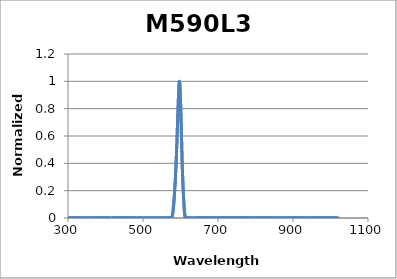
| Category | Normalized Intensity |
|---|---|
| 194.11 | 0.001 |
| 194.31 | -0.001 |
| 194.52 | 0.001 |
| 194.72 | -0.001 |
| 194.92 | -0.001 |
| 195.12 | 0.001 |
| 195.33 | -0.001 |
| 195.53 | -0.001 |
| 195.73 | 0.001 |
| 195.93 | -0.003 |
| 196.13 | 0 |
| 196.34 | -0.002 |
| 196.54 | 0.002 |
| 196.74 | -0.003 |
| 196.94 | 0 |
| 197.15 | -0.003 |
| 197.35 | -0.001 |
| 197.55 | 0 |
| 197.75 | -0.001 |
| 197.96 | 0 |
| 198.16 | 0.002 |
| 198.36 | -0.001 |
| 198.56 | 0.002 |
| 198.76 | 0 |
| 198.97 | 0 |
| 199.17 | -0.003 |
| 199.37 | 0.001 |
| 199.57 | -0.002 |
| 199.78 | -0.001 |
| 199.98 | -0.002 |
| 200.18 | 0 |
| 200.39 | 0 |
| 200.59 | -0.001 |
| 200.79 | -0.001 |
| 200.99 | 0.003 |
| 201.2 | 0.001 |
| 201.4 | 0.001 |
| 201.6 | -0.002 |
| 201.8 | 0.003 |
| 202.01 | 0 |
| 202.21 | 0.001 |
| 202.41 | 0 |
| 202.62 | -0.001 |
| 202.82 | -0.001 |
| 203.02 | 0.001 |
| 203.22 | -0.001 |
| 203.43 | -0.001 |
| 203.63 | -0.002 |
| 203.83 | -0.001 |
| 204.04 | -0.001 |
| 204.24 | 0.001 |
| 204.44 | -0.001 |
| 204.64 | -0.001 |
| 204.85 | -0.002 |
| 205.05 | -0.001 |
| 205.25 | -0.004 |
| 205.46 | 0.001 |
| 205.66 | -0.001 |
| 205.86 | 0.001 |
| 206.07 | -0.001 |
| 206.27 | 0.001 |
| 206.47 | -0.001 |
| 206.68 | -0.001 |
| 206.88 | -0.001 |
| 207.08 | -0.003 |
| 207.29 | -0.001 |
| 207.49 | 0 |
| 207.69 | -0.002 |
| 207.89 | 0 |
| 208.1 | -0.001 |
| 208.3 | -0.001 |
| 208.5 | -0.002 |
| 208.71 | 0.001 |
| 208.91 | 0 |
| 209.12 | 0 |
| 209.32 | -0.001 |
| 209.52 | 0.002 |
| 209.73 | 0 |
| 209.93 | -0.002 |
| 210.13 | 0 |
| 210.34 | 0.001 |
| 210.54 | -0.002 |
| 210.74 | 0.002 |
| 210.95 | -0.001 |
| 211.15 | 0.002 |
| 211.35 | 0 |
| 211.56 | 0 |
| 211.76 | -0.001 |
| 211.96 | 0.001 |
| 212.17 | -0.002 |
| 212.37 | 0.001 |
| 212.58 | -0.001 |
| 212.78 | 0 |
| 212.98 | -0.001 |
| 213.19 | 0 |
| 213.39 | -0.001 |
| 213.59 | 0 |
| 213.8 | -0.001 |
| 214.0 | -0.001 |
| 214.21 | -0.001 |
| 214.41 | -0.001 |
| 214.61 | 0.001 |
| 214.82 | -0.001 |
| 215.02 | -0.002 |
| 215.23 | -0.001 |
| 215.43 | 0 |
| 215.63 | 0 |
| 215.84 | 0 |
| 216.04 | 0.003 |
| 216.25 | -0.001 |
| 216.45 | 0 |
| 216.65 | -0.001 |
| 216.86 | -0.002 |
| 217.06 | -0.002 |
| 217.27 | 0 |
| 217.47 | -0.001 |
| 217.67 | 0 |
| 217.88 | 0 |
| 218.08 | 0.001 |
| 218.29 | -0.001 |
| 218.49 | 0 |
| 218.7 | 0.002 |
| 218.9 | -0.001 |
| 219.1 | 0.001 |
| 219.31 | -0.001 |
| 219.51 | -0.002 |
| 219.72 | 0 |
| 219.92 | -0.001 |
| 220.13 | 0.002 |
| 220.33 | -0.001 |
| 220.53 | 0 |
| 220.74 | -0.001 |
| 220.94 | -0.001 |
| 221.15 | -0.002 |
| 221.35 | 0 |
| 221.56 | -0.001 |
| 221.76 | -0.001 |
| 221.97 | -0.003 |
| 222.17 | 0 |
| 222.38 | -0.001 |
| 222.58 | -0.002 |
| 222.78 | -0.001 |
| 222.99 | 0 |
| 223.19 | -0.002 |
| 223.4 | 0.001 |
| 223.6 | 0 |
| 223.81 | 0.001 |
| 224.01 | 0 |
| 224.22 | -0.002 |
| 224.42 | -0.001 |
| 224.63 | -0.002 |
| 224.83 | -0.002 |
| 225.04 | 0 |
| 225.24 | -0.001 |
| 225.45 | 0.001 |
| 225.65 | -0.001 |
| 225.86 | 0 |
| 226.06 | -0.001 |
| 226.27 | 0 |
| 226.47 | 0.001 |
| 226.68 | -0.002 |
| 226.88 | -0.001 |
| 227.09 | -0.002 |
| 227.29 | -0.001 |
| 227.5 | -0.002 |
| 227.7 | -0.001 |
| 227.91 | 0 |
| 228.11 | 0 |
| 228.32 | -0.001 |
| 228.52 | 0 |
| 228.73 | 0.001 |
| 228.93 | -0.003 |
| 229.14 | -0.001 |
| 229.34 | 0.001 |
| 229.55 | 0.001 |
| 229.75 | 0 |
| 229.96 | 0 |
| 230.16 | -0.001 |
| 230.37 | 0 |
| 230.57 | 0 |
| 230.78 | 0.001 |
| 230.98 | 0.002 |
| 231.19 | 0.001 |
| 231.39 | -0.001 |
| 231.6 | 0.001 |
| 231.81 | -0.001 |
| 232.01 | -0.001 |
| 232.22 | -0.002 |
| 232.42 | -0.001 |
| 232.63 | -0.004 |
| 232.83 | 0 |
| 233.04 | -0.002 |
| 233.24 | 0.003 |
| 233.45 | 0 |
| 233.65 | 0.002 |
| 233.86 | -0.003 |
| 234.07 | 0 |
| 234.27 | 0 |
| 234.48 | 0.001 |
| 234.68 | 0 |
| 234.89 | 0 |
| 235.09 | 0 |
| 235.3 | 0.001 |
| 235.51 | -0.001 |
| 235.71 | 0.002 |
| 235.92 | -0.003 |
| 236.12 | -0.001 |
| 236.33 | 0 |
| 236.53 | 0 |
| 236.74 | 0 |
| 236.95 | -0.001 |
| 237.15 | -0.002 |
| 237.36 | -0.001 |
| 237.56 | 0 |
| 237.77 | -0.001 |
| 237.98 | -0.002 |
| 238.18 | -0.001 |
| 238.39 | -0.001 |
| 238.59 | 0.001 |
| 238.8 | 0.002 |
| 239.01 | 0.001 |
| 239.21 | 0.001 |
| 239.42 | -0.002 |
| 239.62 | -0.001 |
| 239.83 | 0.001 |
| 240.04 | -0.002 |
| 240.24 | -0.001 |
| 240.45 | -0.002 |
| 240.65 | -0.001 |
| 240.86 | -0.001 |
| 241.07 | -0.001 |
| 241.27 | -0.001 |
| 241.48 | 0 |
| 241.69 | -0.001 |
| 241.89 | -0.001 |
| 242.1 | -0.001 |
| 242.3 | 0.001 |
| 242.51 | -0.002 |
| 242.72 | -0.001 |
| 242.92 | -0.002 |
| 243.13 | 0.001 |
| 243.34 | -0.001 |
| 243.54 | 0.001 |
| 243.75 | 0.001 |
| 243.96 | -0.001 |
| 244.16 | -0.002 |
| 244.37 | -0.002 |
| 244.58 | 0 |
| 244.78 | 0.001 |
| 244.99 | -0.001 |
| 245.19 | 0.001 |
| 245.4 | -0.002 |
| 245.61 | -0.003 |
| 245.81 | -0.003 |
| 246.02 | -0.001 |
| 246.23 | 0 |
| 246.43 | -0.001 |
| 246.64 | -0.001 |
| 246.85 | 0.001 |
| 247.05 | -0.004 |
| 247.26 | 0.001 |
| 247.47 | 0 |
| 247.67 | -0.001 |
| 247.88 | 0 |
| 248.09 | 0.001 |
| 248.3 | -0.002 |
| 248.5 | 0.002 |
| 248.71 | -0.002 |
| 248.92 | 0 |
| 249.12 | 0 |
| 249.33 | 0 |
| 249.54 | -0.001 |
| 249.74 | 0.001 |
| 249.95 | -0.002 |
| 250.16 | 0 |
| 250.36 | -0.002 |
| 250.57 | 0.001 |
| 250.78 | -0.002 |
| 250.99 | -0.001 |
| 251.19 | -0.002 |
| 251.4 | 0.002 |
| 251.61 | 0 |
| 251.81 | 0.002 |
| 252.02 | -0.001 |
| 252.23 | 0.002 |
| 252.44 | 0.001 |
| 252.64 | 0 |
| 252.85 | 0 |
| 253.06 | 0 |
| 253.26 | -0.002 |
| 253.47 | 0 |
| 253.68 | -0.002 |
| 253.89 | -0.001 |
| 254.09 | -0.002 |
| 254.3 | -0.001 |
| 254.51 | 0 |
| 254.72 | 0.002 |
| 254.92 | -0.001 |
| 255.13 | 0.001 |
| 255.34 | -0.002 |
| 255.54 | -0.001 |
| 255.75 | 0.002 |
| 255.96 | 0 |
| 256.17 | -0.001 |
| 256.37 | 0.002 |
| 256.58 | 0 |
| 256.79 | 0.001 |
| 257.0 | 0.001 |
| 257.2 | 0.001 |
| 257.41 | -0.001 |
| 257.62 | 0.001 |
| 257.83 | -0.001 |
| 258.04 | -0.001 |
| 258.24 | 0 |
| 258.45 | -0.001 |
| 258.66 | 0 |
| 258.87 | 0.002 |
| 259.07 | -0.001 |
| 259.28 | -0.002 |
| 259.49 | -0.002 |
| 259.7 | 0 |
| 259.9 | 0 |
| 260.11 | -0.002 |
| 260.32 | -0.001 |
| 260.53 | 0 |
| 260.74 | -0.001 |
| 260.94 | -0.001 |
| 261.15 | -0.002 |
| 261.36 | 0.001 |
| 261.57 | -0.002 |
| 261.78 | 0 |
| 261.98 | 0.001 |
| 262.19 | 0 |
| 262.4 | -0.002 |
| 262.61 | 0 |
| 262.82 | -0.002 |
| 263.02 | 0 |
| 263.23 | -0.001 |
| 263.44 | 0.002 |
| 263.65 | -0.001 |
| 263.86 | 0 |
| 264.06 | 0 |
| 264.27 | 0.001 |
| 264.48 | 0 |
| 264.69 | 0 |
| 264.9 | 0.001 |
| 265.11 | 0.002 |
| 265.31 | 0 |
| 265.52 | -0.001 |
| 265.73 | -0.002 |
| 265.94 | 0 |
| 266.15 | 0.001 |
| 266.35 | 0 |
| 266.56 | -0.003 |
| 266.77 | 0 |
| 266.98 | 0 |
| 267.19 | 0 |
| 267.4 | -0.001 |
| 267.61 | 0 |
| 267.81 | -0.002 |
| 268.02 | 0 |
| 268.23 | -0.001 |
| 268.44 | 0.001 |
| 268.65 | -0.001 |
| 268.86 | 0.002 |
| 269.06 | -0.001 |
| 269.27 | 0.001 |
| 269.48 | -0.001 |
| 269.69 | 0.001 |
| 269.9 | -0.001 |
| 270.11 | -0.001 |
| 270.32 | -0.003 |
| 270.52 | 0.001 |
| 270.73 | -0.001 |
| 270.94 | -0.001 |
| 271.15 | -0.001 |
| 271.36 | -0.001 |
| 271.57 | 0 |
| 271.78 | 0 |
| 271.99 | 0 |
| 272.19 | 0.002 |
| 272.4 | -0.001 |
| 272.61 | 0.001 |
| 272.82 | -0.001 |
| 273.03 | -0.002 |
| 273.24 | 0 |
| 273.45 | 0.001 |
| 273.66 | 0 |
| 273.87 | 0 |
| 274.07 | -0.002 |
| 274.28 | 0.001 |
| 274.49 | -0.001 |
| 274.7 | -0.001 |
| 274.91 | 0.001 |
| 275.12 | -0.001 |
| 275.33 | -0.002 |
| 275.54 | 0 |
| 275.75 | -0.002 |
| 275.96 | -0.001 |
| 276.17 | -0.001 |
| 276.37 | 0 |
| 276.58 | -0.001 |
| 276.79 | -0.001 |
| 277.0 | -0.001 |
| 277.21 | -0.002 |
| 277.42 | -0.002 |
| 277.63 | 0.001 |
| 277.84 | 0.002 |
| 278.05 | 0.001 |
| 278.26 | 0 |
| 278.47 | 0 |
| 278.68 | 0.001 |
| 278.89 | 0.001 |
| 279.09 | -0.001 |
| 279.3 | 0.001 |
| 279.51 | 0.002 |
| 279.72 | 0.001 |
| 279.93 | -0.002 |
| 280.14 | 0.001 |
| 280.35 | 0.001 |
| 280.56 | 0.001 |
| 280.77 | 0.001 |
| 280.98 | -0.001 |
| 281.19 | -0.001 |
| 281.4 | 0.002 |
| 281.61 | -0.004 |
| 281.82 | 0 |
| 282.03 | 0.001 |
| 282.24 | 0 |
| 282.45 | -0.001 |
| 282.66 | 0.001 |
| 282.87 | -0.002 |
| 283.08 | 0 |
| 283.29 | 0 |
| 283.5 | 0.002 |
| 283.7 | -0.003 |
| 283.91 | -0.001 |
| 284.12 | -0.001 |
| 284.33 | 0 |
| 284.54 | 0 |
| 284.75 | -0.001 |
| 284.96 | -0.001 |
| 285.17 | 0.002 |
| 285.38 | -0.002 |
| 285.59 | 0 |
| 285.8 | -0.002 |
| 286.01 | 0 |
| 286.22 | 0 |
| 286.43 | 0.001 |
| 286.64 | -0.001 |
| 286.85 | -0.001 |
| 287.06 | -0.002 |
| 287.27 | -0.001 |
| 287.48 | -0.002 |
| 287.69 | 0 |
| 287.9 | -0.001 |
| 288.11 | 0 |
| 288.32 | 0.001 |
| 288.53 | -0.001 |
| 288.74 | -0.002 |
| 288.95 | 0.001 |
| 289.16 | -0.001 |
| 289.37 | 0.001 |
| 289.58 | -0.001 |
| 289.79 | -0.001 |
| 290.0 | -0.001 |
| 290.21 | -0.001 |
| 290.43 | -0.001 |
| 290.64 | 0.001 |
| 290.85 | -0.001 |
| 291.06 | -0.001 |
| 291.27 | 0 |
| 291.48 | 0 |
| 291.69 | -0.002 |
| 291.9 | 0 |
| 292.11 | -0.001 |
| 292.32 | 0 |
| 292.53 | 0 |
| 292.74 | 0.002 |
| 292.95 | 0 |
| 293.16 | -0.003 |
| 293.37 | -0.001 |
| 293.58 | -0.002 |
| 293.79 | 0 |
| 294.0 | 0.001 |
| 294.21 | -0.003 |
| 294.42 | 0 |
| 294.63 | 0.001 |
| 294.84 | 0.002 |
| 295.06 | -0.002 |
| 295.27 | 0 |
| 295.48 | -0.001 |
| 295.69 | 0.001 |
| 295.9 | 0.002 |
| 296.11 | -0.002 |
| 296.32 | 0.002 |
| 296.53 | 0.002 |
| 296.74 | -0.001 |
| 296.95 | 0.001 |
| 297.16 | -0.002 |
| 297.37 | 0 |
| 297.58 | 0.001 |
| 297.79 | -0.001 |
| 298.01 | -0.002 |
| 298.22 | -0.003 |
| 298.43 | 0.001 |
| 298.64 | 0.001 |
| 298.85 | 0.001 |
| 299.06 | -0.001 |
| 299.27 | 0.001 |
| 299.48 | 0.003 |
| 299.69 | -0.001 |
| 299.9 | 0 |
| 300.12 | -0.002 |
| 300.33 | 0.001 |
| 300.54 | -0.002 |
| 300.75 | 0.001 |
| 300.96 | 0 |
| 301.17 | 0.001 |
| 301.38 | 0 |
| 301.59 | 0 |
| 301.8 | -0.001 |
| 302.02 | 0 |
| 302.23 | 0 |
| 302.44 | -0.001 |
| 302.65 | -0.001 |
| 302.86 | 0 |
| 303.07 | -0.001 |
| 303.28 | 0 |
| 303.49 | 0.001 |
| 303.71 | 0.003 |
| 303.92 | -0.002 |
| 304.13 | 0.002 |
| 304.34 | 0.001 |
| 304.55 | -0.001 |
| 304.76 | -0.002 |
| 304.97 | 0.001 |
| 305.18 | -0.001 |
| 305.4 | 0.001 |
| 305.61 | -0.003 |
| 305.82 | 0 |
| 306.03 | -0.001 |
| 306.24 | -0.001 |
| 306.45 | 0 |
| 306.67 | 0.001 |
| 306.88 | -0.001 |
| 307.09 | 0.002 |
| 307.3 | -0.003 |
| 307.51 | -0.001 |
| 307.72 | 0 |
| 307.93 | 0 |
| 308.15 | 0 |
| 308.36 | -0.002 |
| 308.57 | 0 |
| 308.78 | 0 |
| 308.99 | -0.001 |
| 309.21 | 0 |
| 309.42 | 0 |
| 309.63 | 0 |
| 309.84 | -0.003 |
| 310.05 | -0.001 |
| 310.26 | 0.001 |
| 310.48 | 0.001 |
| 310.69 | -0.002 |
| 310.9 | 0.001 |
| 311.11 | 0.001 |
| 311.32 | 0.002 |
| 311.54 | -0.002 |
| 311.75 | 0.001 |
| 311.96 | 0.002 |
| 312.17 | -0.001 |
| 312.38 | -0.001 |
| 312.6 | 0 |
| 312.81 | 0 |
| 313.02 | 0.001 |
| 313.23 | -0.001 |
| 313.44 | 0.003 |
| 313.66 | 0 |
| 313.87 | 0.002 |
| 314.08 | -0.001 |
| 314.29 | -0.001 |
| 314.5 | -0.002 |
| 314.72 | 0 |
| 314.93 | -0.001 |
| 315.14 | 0 |
| 315.35 | 0 |
| 315.56 | 0 |
| 315.78 | -0.002 |
| 315.99 | -0.002 |
| 316.2 | 0 |
| 316.41 | 0.001 |
| 316.63 | -0.001 |
| 316.84 | -0.001 |
| 317.05 | 0 |
| 317.26 | 0 |
| 317.48 | 0.001 |
| 317.69 | 0 |
| 317.9 | 0 |
| 318.11 | -0.002 |
| 318.33 | -0.004 |
| 318.54 | 0 |
| 318.75 | -0.002 |
| 318.96 | 0 |
| 319.17 | 0.001 |
| 319.39 | 0.002 |
| 319.6 | -0.002 |
| 319.81 | 0.001 |
| 320.03 | 0.002 |
| 320.24 | 0.001 |
| 320.45 | 0 |
| 320.66 | 0 |
| 320.88 | 0.001 |
| 321.09 | 0 |
| 321.3 | -0.003 |
| 321.51 | 0 |
| 321.73 | -0.005 |
| 321.94 | 0 |
| 322.15 | -0.001 |
| 322.36 | 0 |
| 322.58 | -0.003 |
| 322.79 | 0 |
| 323.0 | -0.001 |
| 323.22 | 0.001 |
| 323.43 | -0.001 |
| 323.64 | -0.001 |
| 323.85 | -0.001 |
| 324.07 | 0.002 |
| 324.28 | -0.002 |
| 324.49 | 0 |
| 324.71 | -0.002 |
| 324.92 | -0.001 |
| 325.13 | -0.002 |
| 325.34 | 0 |
| 325.56 | -0.001 |
| 325.77 | -0.001 |
| 325.98 | -0.003 |
| 326.2 | 0.001 |
| 326.41 | 0 |
| 326.62 | 0 |
| 326.84 | -0.004 |
| 327.05 | 0.001 |
| 327.26 | -0.002 |
| 327.47 | 0 |
| 327.69 | -0.001 |
| 327.9 | 0.001 |
| 328.11 | 0 |
| 328.33 | -0.001 |
| 328.54 | -0.001 |
| 328.75 | 0.001 |
| 328.97 | -0.001 |
| 329.18 | -0.001 |
| 329.39 | -0.001 |
| 329.61 | 0.002 |
| 329.82 | 0 |
| 330.03 | -0.001 |
| 330.25 | 0.002 |
| 330.46 | 0 |
| 330.67 | -0.001 |
| 330.89 | 0 |
| 331.1 | 0.001 |
| 331.31 | -0.001 |
| 331.53 | -0.001 |
| 331.74 | 0.002 |
| 331.95 | 0.002 |
| 332.17 | 0 |
| 332.38 | -0.001 |
| 332.59 | 0.002 |
| 332.81 | -0.002 |
| 333.02 | 0 |
| 333.24 | 0.001 |
| 333.45 | 0 |
| 333.66 | 0 |
| 333.88 | 0.001 |
| 334.09 | -0.001 |
| 334.3 | 0 |
| 334.52 | -0.003 |
| 334.73 | 0.001 |
| 334.94 | -0.002 |
| 335.16 | -0.001 |
| 335.37 | -0.002 |
| 335.59 | 0 |
| 335.8 | -0.001 |
| 336.01 | 0.001 |
| 336.23 | -0.001 |
| 336.44 | 0 |
| 336.65 | 0.001 |
| 336.87 | -0.001 |
| 337.08 | 0.001 |
| 337.3 | -0.001 |
| 337.51 | 0 |
| 337.72 | 0.001 |
| 337.94 | 0 |
| 338.15 | -0.001 |
| 338.37 | -0.002 |
| 338.58 | 0.001 |
| 338.79 | 0 |
| 339.01 | 0 |
| 339.22 | -0.001 |
| 339.44 | 0 |
| 339.65 | -0.001 |
| 339.86 | 0.002 |
| 340.08 | -0.002 |
| 340.29 | -0.001 |
| 340.51 | -0.001 |
| 340.72 | -0.002 |
| 340.93 | -0.004 |
| 341.15 | 0 |
| 341.36 | -0.001 |
| 341.58 | -0.001 |
| 341.79 | 0 |
| 342.0 | -0.001 |
| 342.22 | -0.002 |
| 342.43 | 0 |
| 342.65 | 0 |
| 342.86 | 0 |
| 343.08 | 0.001 |
| 343.29 | 0.001 |
| 343.5 | 0.001 |
| 343.72 | 0.001 |
| 343.93 | -0.002 |
| 344.15 | -0.001 |
| 344.36 | -0.002 |
| 344.58 | 0 |
| 344.79 | -0.001 |
| 345.0 | 0.001 |
| 345.22 | 0 |
| 345.43 | 0 |
| 345.65 | 0 |
| 345.86 | -0.002 |
| 346.08 | 0.001 |
| 346.29 | 0.001 |
| 346.51 | -0.001 |
| 346.72 | 0 |
| 346.94 | -0.002 |
| 347.15 | 0.002 |
| 347.36 | -0.002 |
| 347.58 | -0.002 |
| 347.79 | -0.003 |
| 348.01 | 0.001 |
| 348.22 | -0.002 |
| 348.44 | 0 |
| 348.65 | -0.001 |
| 348.87 | 0.001 |
| 349.08 | -0.001 |
| 349.3 | 0.001 |
| 349.51 | -0.002 |
| 349.73 | 0.001 |
| 349.94 | -0.002 |
| 350.16 | 0.001 |
| 350.37 | 0.002 |
| 350.59 | -0.001 |
| 350.8 | -0.001 |
| 351.01 | 0.002 |
| 351.23 | -0.002 |
| 351.44 | -0.001 |
| 351.66 | 0 |
| 351.87 | -0.001 |
| 352.09 | -0.001 |
| 352.3 | 0 |
| 352.52 | -0.001 |
| 352.73 | -0.001 |
| 352.95 | -0.001 |
| 353.16 | -0.001 |
| 353.38 | -0.001 |
| 353.59 | -0.001 |
| 353.81 | 0.001 |
| 354.02 | 0 |
| 354.24 | -0.002 |
| 354.45 | 0 |
| 354.67 | -0.002 |
| 354.88 | -0.001 |
| 355.1 | 0.001 |
| 355.32 | -0.001 |
| 355.53 | 0 |
| 355.75 | 0.001 |
| 355.96 | -0.003 |
| 356.18 | 0.001 |
| 356.39 | 0.001 |
| 356.61 | -0.001 |
| 356.82 | -0.002 |
| 357.04 | 0 |
| 357.25 | 0 |
| 357.47 | 0 |
| 357.68 | -0.001 |
| 357.9 | -0.001 |
| 358.11 | -0.002 |
| 358.33 | -0.001 |
| 358.54 | 0 |
| 358.76 | -0.002 |
| 358.98 | -0.001 |
| 359.19 | 0 |
| 359.41 | 0 |
| 359.62 | -0.003 |
| 359.84 | -0.003 |
| 360.05 | 0 |
| 360.27 | -0.002 |
| 360.48 | -0.001 |
| 360.7 | 0 |
| 360.91 | 0 |
| 361.13 | -0.001 |
| 361.35 | 0.001 |
| 361.56 | -0.001 |
| 361.78 | -0.001 |
| 361.99 | -0.002 |
| 362.21 | 0 |
| 362.42 | 0 |
| 362.64 | -0.001 |
| 362.86 | 0.001 |
| 363.07 | 0.001 |
| 363.29 | 0 |
| 363.5 | -0.001 |
| 363.72 | -0.002 |
| 363.93 | 0 |
| 364.15 | -0.001 |
| 364.37 | 0 |
| 364.58 | -0.002 |
| 364.8 | 0 |
| 365.01 | -0.004 |
| 365.23 | 0.001 |
| 365.45 | -0.001 |
| 365.66 | 0.001 |
| 365.88 | 0.001 |
| 366.09 | -0.001 |
| 366.31 | -0.001 |
| 366.53 | 0.001 |
| 366.74 | -0.001 |
| 366.96 | 0 |
| 367.17 | -0.003 |
| 367.39 | 0 |
| 367.61 | 0 |
| 367.82 | -0.001 |
| 368.04 | 0 |
| 368.25 | 0.002 |
| 368.47 | 0 |
| 368.69 | 0 |
| 368.9 | 0 |
| 369.12 | 0 |
| 369.33 | 0.003 |
| 369.55 | 0 |
| 369.77 | -0.001 |
| 369.98 | 0 |
| 370.2 | -0.002 |
| 370.41 | 0 |
| 370.63 | -0.001 |
| 370.85 | 0.001 |
| 371.06 | 0 |
| 371.28 | -0.001 |
| 371.5 | -0.002 |
| 371.71 | 0.001 |
| 371.93 | -0.001 |
| 372.15 | 0 |
| 372.36 | -0.005 |
| 372.58 | -0.001 |
| 372.79 | -0.001 |
| 373.01 | 0.002 |
| 373.23 | -0.002 |
| 373.44 | 0.001 |
| 373.66 | 0.001 |
| 373.88 | 0 |
| 374.09 | 0 |
| 374.31 | 0.002 |
| 374.53 | -0.001 |
| 374.74 | -0.001 |
| 374.96 | -0.001 |
| 375.18 | 0.001 |
| 375.39 | -0.002 |
| 375.61 | 0 |
| 375.83 | 0 |
| 376.04 | -0.001 |
| 376.26 | 0 |
| 376.48 | 0.001 |
| 376.69 | -0.001 |
| 376.91 | -0.001 |
| 377.13 | -0.001 |
| 377.34 | 0.002 |
| 377.56 | 0.001 |
| 377.78 | 0 |
| 377.99 | 0.001 |
| 378.21 | 0 |
| 378.43 | -0.003 |
| 378.64 | 0 |
| 378.86 | -0.001 |
| 379.08 | 0.002 |
| 379.29 | -0.001 |
| 379.51 | 0.002 |
| 379.73 | 0 |
| 379.94 | -0.001 |
| 380.16 | -0.001 |
| 380.38 | 0 |
| 380.6 | 0 |
| 380.81 | 0.003 |
| 381.03 | 0.002 |
| 381.25 | -0.001 |
| 381.46 | 0.001 |
| 381.68 | -0.002 |
| 381.9 | -0.002 |
| 382.11 | 0 |
| 382.33 | -0.002 |
| 382.55 | -0.002 |
| 382.77 | -0.001 |
| 382.98 | 0.001 |
| 383.2 | 0.001 |
| 383.42 | 0 |
| 383.63 | 0 |
| 383.85 | -0.001 |
| 384.07 | 0 |
| 384.29 | -0.002 |
| 384.5 | 0.001 |
| 384.72 | 0.002 |
| 384.94 | -0.001 |
| 385.15 | 0 |
| 385.37 | -0.001 |
| 385.59 | 0.002 |
| 385.81 | -0.002 |
| 386.02 | 0.001 |
| 386.24 | -0.001 |
| 386.46 | -0.001 |
| 386.68 | 0.001 |
| 386.89 | 0 |
| 387.11 | -0.001 |
| 387.33 | 0.001 |
| 387.55 | 0.003 |
| 387.76 | 0.001 |
| 387.98 | -0.001 |
| 388.2 | 0.002 |
| 388.42 | -0.001 |
| 388.63 | 0.001 |
| 388.85 | 0.002 |
| 389.07 | -0.002 |
| 389.29 | -0.002 |
| 389.5 | 0.001 |
| 389.72 | 0.001 |
| 389.94 | 0.001 |
| 390.16 | 0.001 |
| 390.37 | -0.001 |
| 390.59 | 0 |
| 390.81 | 0 |
| 391.03 | -0.002 |
| 391.24 | 0.003 |
| 391.46 | -0.001 |
| 391.68 | 0 |
| 391.9 | 0 |
| 392.11 | 0.002 |
| 392.33 | -0.002 |
| 392.55 | 0.001 |
| 392.77 | -0.001 |
| 392.99 | -0.001 |
| 393.2 | -0.001 |
| 393.42 | -0.001 |
| 393.64 | -0.002 |
| 393.86 | 0.003 |
| 394.07 | -0.002 |
| 394.29 | 0.002 |
| 394.51 | 0 |
| 394.73 | -0.002 |
| 394.95 | -0.002 |
| 395.16 | 0 |
| 395.38 | -0.001 |
| 395.6 | 0.001 |
| 395.82 | -0.001 |
| 396.04 | 0.001 |
| 396.25 | 0 |
| 396.47 | 0.003 |
| 396.69 | -0.001 |
| 396.91 | 0.001 |
| 397.13 | 0 |
| 397.34 | 0.001 |
| 397.56 | 0 |
| 397.78 | 0 |
| 398.0 | -0.001 |
| 398.22 | 0.001 |
| 398.44 | -0.004 |
| 398.65 | 0.003 |
| 398.87 | 0.002 |
| 399.09 | -0.001 |
| 399.31 | 0 |
| 399.53 | 0.001 |
| 399.74 | 0 |
| 399.96 | 0 |
| 400.18 | 0 |
| 400.4 | 0 |
| 400.62 | -0.002 |
| 400.84 | 0 |
| 401.05 | -0.001 |
| 401.27 | 0.001 |
| 401.49 | 0 |
| 401.71 | -0.001 |
| 401.93 | 0 |
| 402.15 | 0 |
| 402.36 | -0.001 |
| 402.58 | 0 |
| 402.8 | 0 |
| 403.02 | 0.001 |
| 403.24 | 0.001 |
| 403.46 | 0 |
| 403.68 | 0 |
| 403.89 | 0 |
| 404.11 | 0 |
| 404.33 | -0.002 |
| 404.55 | -0.001 |
| 404.77 | 0 |
| 404.99 | -0.001 |
| 405.21 | 0.001 |
| 405.42 | 0 |
| 405.64 | -0.002 |
| 405.86 | 0.002 |
| 406.08 | -0.001 |
| 406.3 | 0 |
| 406.52 | 0 |
| 406.74 | 0 |
| 406.95 | 0.002 |
| 407.17 | 0 |
| 407.39 | 0 |
| 407.61 | 0 |
| 407.83 | -0.002 |
| 408.05 | 0 |
| 408.27 | 0 |
| 408.49 | 0.001 |
| 408.71 | -0.002 |
| 408.92 | -0.001 |
| 409.14 | 0 |
| 409.36 | -0.001 |
| 409.58 | 0.001 |
| 409.8 | 0.002 |
| 410.02 | 0 |
| 410.24 | 0.001 |
| 410.46 | 0 |
| 410.68 | 0 |
| 410.89 | 0 |
| 411.11 | 0 |
| 411.33 | -0.001 |
| 411.55 | 0.001 |
| 411.77 | 0.001 |
| 411.99 | 0.001 |
| 412.21 | -0.002 |
| 412.43 | 0.001 |
| 412.65 | -0.002 |
| 412.87 | 0 |
| 413.08 | -0.002 |
| 413.3 | 0 |
| 413.52 | 0 |
| 413.74 | 0 |
| 413.96 | 0 |
| 414.18 | -0.001 |
| 414.4 | 0 |
| 414.62 | -0.002 |
| 414.84 | -0.003 |
| 415.06 | -0.001 |
| 415.28 | -0.001 |
| 415.5 | 0 |
| 415.72 | -0.001 |
| 415.93 | -0.001 |
| 416.15 | -0.001 |
| 416.37 | -0.001 |
| 416.59 | -0.002 |
| 416.81 | 0.001 |
| 417.03 | -0.002 |
| 417.25 | 0.001 |
| 417.47 | 0.001 |
| 417.69 | 0.001 |
| 417.91 | 0 |
| 418.13 | 0.001 |
| 418.35 | -0.002 |
| 418.57 | 0.001 |
| 418.79 | -0.004 |
| 419.01 | -0.001 |
| 419.23 | -0.001 |
| 419.45 | -0.001 |
| 419.67 | -0.002 |
| 419.89 | 0.003 |
| 420.1 | -0.001 |
| 420.32 | 0 |
| 420.54 | -0.001 |
| 420.76 | 0.002 |
| 420.98 | 0 |
| 421.2 | 0 |
| 421.42 | -0.002 |
| 421.64 | 0.002 |
| 421.86 | -0.001 |
| 422.08 | 0 |
| 422.3 | 0.002 |
| 422.52 | 0 |
| 422.74 | 0.001 |
| 422.96 | 0 |
| 423.18 | 0.001 |
| 423.4 | 0.004 |
| 423.62 | 0 |
| 423.84 | 0.001 |
| 424.06 | 0 |
| 424.28 | -0.001 |
| 424.5 | 0 |
| 424.72 | -0.001 |
| 424.94 | 0.001 |
| 425.16 | 0 |
| 425.38 | 0.001 |
| 425.6 | 0 |
| 425.82 | 0 |
| 426.04 | 0.001 |
| 426.26 | 0 |
| 426.48 | 0 |
| 426.7 | -0.001 |
| 426.92 | -0.001 |
| 427.14 | -0.001 |
| 427.36 | 0.001 |
| 427.58 | -0.002 |
| 427.8 | -0.001 |
| 428.02 | 0 |
| 428.24 | 0 |
| 428.46 | 0 |
| 428.68 | 0 |
| 428.9 | 0 |
| 429.12 | -0.001 |
| 429.34 | 0 |
| 429.56 | 0 |
| 429.78 | -0.003 |
| 430.0 | 0.001 |
| 430.22 | -0.002 |
| 430.44 | 0.001 |
| 430.66 | -0.001 |
| 430.88 | 0.001 |
| 431.1 | 0 |
| 431.32 | 0.001 |
| 431.54 | -0.002 |
| 431.76 | 0.001 |
| 431.98 | -0.001 |
| 432.2 | 0.001 |
| 432.42 | 0 |
| 432.64 | 0 |
| 432.87 | -0.001 |
| 433.09 | -0.002 |
| 433.31 | -0.001 |
| 433.53 | 0.002 |
| 433.75 | 0 |
| 433.97 | 0 |
| 434.19 | -0.003 |
| 434.41 | 0 |
| 434.63 | -0.002 |
| 434.85 | 0.002 |
| 435.07 | -0.002 |
| 435.29 | 0 |
| 435.51 | 0.002 |
| 435.73 | -0.002 |
| 435.95 | -0.001 |
| 436.17 | 0.001 |
| 436.39 | -0.004 |
| 436.61 | -0.001 |
| 436.83 | -0.001 |
| 437.06 | -0.001 |
| 437.28 | -0.001 |
| 437.5 | 0.002 |
| 437.72 | 0 |
| 437.94 | -0.001 |
| 438.16 | 0 |
| 438.38 | 0.001 |
| 438.6 | -0.001 |
| 438.82 | 0.001 |
| 439.04 | -0.001 |
| 439.26 | -0.002 |
| 439.48 | 0 |
| 439.7 | 0.001 |
| 439.93 | -0.002 |
| 440.15 | -0.002 |
| 440.37 | 0.002 |
| 440.59 | 0.001 |
| 440.81 | 0 |
| 441.03 | 0 |
| 441.25 | 0 |
| 441.47 | 0.001 |
| 441.69 | -0.001 |
| 441.91 | 0.002 |
| 442.13 | -0.001 |
| 442.36 | 0.001 |
| 442.58 | -0.002 |
| 442.8 | 0.001 |
| 443.02 | 0 |
| 443.24 | 0.002 |
| 443.46 | 0.002 |
| 443.68 | 0.002 |
| 443.9 | -0.001 |
| 444.12 | 0.001 |
| 444.35 | 0.001 |
| 444.57 | 0.001 |
| 444.79 | 0.002 |
| 445.01 | 0 |
| 445.23 | -0.001 |
| 445.45 | -0.001 |
| 445.67 | -0.003 |
| 445.89 | 0 |
| 446.12 | -0.001 |
| 446.34 | -0.001 |
| 446.56 | 0 |
| 446.78 | 0 |
| 447.0 | -0.001 |
| 447.22 | 0.001 |
| 447.44 | 0.002 |
| 447.66 | 0 |
| 447.89 | 0 |
| 448.11 | 0.001 |
| 448.33 | 0 |
| 448.55 | 0.001 |
| 448.77 | 0 |
| 448.99 | 0.001 |
| 449.21 | 0 |
| 449.44 | 0.001 |
| 449.66 | -0.002 |
| 449.88 | -0.001 |
| 450.1 | -0.001 |
| 450.32 | 0 |
| 450.54 | -0.002 |
| 450.76 | 0 |
| 450.99 | 0 |
| 451.21 | 0.002 |
| 451.43 | 0.001 |
| 451.65 | 0 |
| 451.87 | -0.003 |
| 452.09 | 0.002 |
| 452.32 | -0.002 |
| 452.54 | -0.001 |
| 452.76 | -0.001 |
| 452.98 | 0.001 |
| 453.2 | -0.001 |
| 453.42 | -0.001 |
| 453.65 | -0.002 |
| 453.87 | -0.001 |
| 454.09 | -0.002 |
| 454.31 | -0.001 |
| 454.53 | -0.001 |
| 454.75 | 0.001 |
| 454.98 | 0.003 |
| 455.2 | 0 |
| 455.42 | -0.001 |
| 455.64 | 0 |
| 455.86 | -0.002 |
| 456.09 | 0.002 |
| 456.31 | 0 |
| 456.53 | 0.001 |
| 456.75 | 0 |
| 456.97 | 0 |
| 457.19 | 0.003 |
| 457.42 | -0.002 |
| 457.64 | 0 |
| 457.86 | -0.001 |
| 458.08 | -0.002 |
| 458.3 | -0.002 |
| 458.53 | 0.001 |
| 458.75 | 0.001 |
| 458.97 | -0.003 |
| 459.19 | 0 |
| 459.41 | 0.001 |
| 459.64 | -0.002 |
| 459.86 | 0.002 |
| 460.08 | 0 |
| 460.3 | -0.001 |
| 460.53 | -0.001 |
| 460.75 | 0 |
| 460.97 | 0 |
| 461.19 | -0.001 |
| 461.41 | 0.001 |
| 461.64 | -0.003 |
| 461.86 | -0.003 |
| 462.08 | 0 |
| 462.3 | 0 |
| 462.53 | 0.001 |
| 462.75 | 0.001 |
| 462.97 | 0.002 |
| 463.19 | -0.002 |
| 463.41 | -0.002 |
| 463.64 | 0 |
| 463.86 | 0 |
| 464.08 | 0 |
| 464.3 | 0 |
| 464.53 | 0.001 |
| 464.75 | 0 |
| 464.97 | 0 |
| 465.19 | -0.001 |
| 465.42 | -0.002 |
| 465.64 | 0.002 |
| 465.86 | -0.001 |
| 466.08 | -0.001 |
| 466.31 | -0.001 |
| 466.53 | 0.002 |
| 466.75 | 0 |
| 466.97 | -0.001 |
| 467.2 | -0.002 |
| 467.42 | 0.002 |
| 467.64 | -0.001 |
| 467.86 | 0.001 |
| 468.09 | -0.001 |
| 468.31 | 0 |
| 468.53 | -0.001 |
| 468.75 | -0.001 |
| 468.98 | 0 |
| 469.2 | 0.001 |
| 469.42 | 0 |
| 469.64 | 0 |
| 469.87 | 0.001 |
| 470.09 | -0.001 |
| 470.31 | 0 |
| 470.54 | 0.002 |
| 470.76 | -0.001 |
| 470.98 | 0 |
| 471.2 | 0.001 |
| 471.43 | 0.001 |
| 471.65 | -0.001 |
| 471.87 | 0 |
| 472.09 | 0.001 |
| 472.32 | 0.003 |
| 472.54 | -0.001 |
| 472.76 | 0.002 |
| 472.99 | -0.001 |
| 473.21 | -0.002 |
| 473.43 | -0.002 |
| 473.65 | 0.001 |
| 473.88 | 0 |
| 474.1 | 0.001 |
| 474.32 | -0.002 |
| 474.55 | -0.001 |
| 474.77 | 0.001 |
| 474.99 | 0 |
| 475.22 | -0.002 |
| 475.44 | 0.001 |
| 475.66 | -0.001 |
| 475.88 | 0.001 |
| 476.11 | 0 |
| 476.33 | 0 |
| 476.55 | -0.001 |
| 476.78 | 0 |
| 477.0 | 0.002 |
| 477.22 | 0 |
| 477.45 | -0.002 |
| 477.67 | 0.001 |
| 477.89 | -0.002 |
| 478.12 | 0 |
| 478.34 | -0.002 |
| 478.56 | 0.002 |
| 478.79 | -0.002 |
| 479.01 | -0.001 |
| 479.23 | -0.002 |
| 479.46 | 0 |
| 479.68 | 0 |
| 479.9 | 0.002 |
| 480.13 | 0.001 |
| 480.35 | -0.001 |
| 480.57 | -0.001 |
| 480.8 | 0.001 |
| 481.02 | -0.001 |
| 481.24 | -0.001 |
| 481.47 | -0.001 |
| 481.69 | -0.001 |
| 481.91 | -0.002 |
| 482.14 | -0.002 |
| 482.36 | 0.001 |
| 482.58 | -0.002 |
| 482.81 | 0 |
| 483.03 | 0 |
| 483.25 | -0.001 |
| 483.48 | 0.001 |
| 483.7 | -0.002 |
| 483.92 | 0 |
| 484.15 | -0.001 |
| 484.37 | 0 |
| 484.59 | -0.001 |
| 484.82 | -0.002 |
| 485.04 | 0 |
| 485.26 | 0.002 |
| 485.49 | -0.002 |
| 485.71 | 0 |
| 485.94 | -0.001 |
| 486.16 | 0.001 |
| 486.38 | -0.001 |
| 486.61 | 0.001 |
| 486.83 | 0 |
| 487.05 | -0.002 |
| 487.28 | -0.001 |
| 487.5 | 0 |
| 487.73 | -0.001 |
| 487.95 | 0.001 |
| 488.17 | 0 |
| 488.4 | 0 |
| 488.62 | 0.001 |
| 488.84 | 0 |
| 489.07 | -0.001 |
| 489.29 | 0.001 |
| 489.52 | -0.002 |
| 489.74 | 0 |
| 489.96 | -0.003 |
| 490.19 | -0.001 |
| 490.41 | -0.001 |
| 490.64 | 0 |
| 490.86 | 0 |
| 491.08 | 0.003 |
| 491.31 | 0.002 |
| 491.53 | 0 |
| 491.76 | 0 |
| 491.98 | 0 |
| 492.2 | 0.001 |
| 492.43 | -0.002 |
| 492.65 | -0.002 |
| 492.88 | -0.002 |
| 493.1 | 0 |
| 493.32 | -0.001 |
| 493.55 | 0.001 |
| 493.77 | -0.001 |
| 494.0 | -0.001 |
| 494.22 | 0.001 |
| 494.44 | 0 |
| 494.67 | 0.002 |
| 494.89 | -0.001 |
| 495.12 | 0.001 |
| 495.34 | 0 |
| 495.56 | 0 |
| 495.79 | -0.001 |
| 496.01 | 0 |
| 496.24 | -0.001 |
| 496.46 | 0.001 |
| 496.69 | 0.001 |
| 496.91 | 0.001 |
| 497.13 | 0.001 |
| 497.36 | 0 |
| 497.58 | -0.002 |
| 497.81 | -0.001 |
| 498.03 | 0.001 |
| 498.26 | 0 |
| 498.48 | -0.001 |
| 498.71 | -0.001 |
| 498.93 | -0.001 |
| 499.15 | -0.001 |
| 499.38 | -0.001 |
| 499.6 | 0 |
| 499.83 | -0.001 |
| 500.05 | 0 |
| 500.28 | -0.001 |
| 500.5 | -0.002 |
| 500.73 | 0 |
| 500.95 | 0 |
| 501.17 | 0.001 |
| 501.4 | 0 |
| 501.62 | 0.001 |
| 501.85 | -0.002 |
| 502.07 | -0.001 |
| 502.3 | 0.001 |
| 502.52 | 0 |
| 502.75 | -0.001 |
| 502.97 | -0.002 |
| 503.2 | -0.002 |
| 503.42 | -0.001 |
| 503.64 | 0.002 |
| 503.87 | -0.001 |
| 504.09 | 0 |
| 504.32 | 0 |
| 504.54 | 0 |
| 504.77 | 0.001 |
| 504.99 | 0 |
| 505.22 | 0.001 |
| 505.44 | 0.001 |
| 505.67 | 0 |
| 505.89 | -0.001 |
| 506.12 | -0.002 |
| 506.34 | 0 |
| 506.57 | 0 |
| 506.79 | -0.001 |
| 507.02 | -0.001 |
| 507.24 | 0.001 |
| 507.47 | -0.001 |
| 507.69 | 0 |
| 507.92 | -0.003 |
| 508.14 | 0 |
| 508.37 | -0.003 |
| 508.59 | 0 |
| 508.82 | 0.001 |
| 509.04 | -0.001 |
| 509.27 | -0.002 |
| 509.49 | 0 |
| 509.72 | -0.002 |
| 509.94 | 0.002 |
| 510.17 | -0.004 |
| 510.39 | 0 |
| 510.62 | -0.001 |
| 510.84 | 0.003 |
| 511.07 | 0 |
| 511.29 | -0.002 |
| 511.52 | -0.001 |
| 511.74 | -0.001 |
| 511.97 | -0.001 |
| 512.19 | -0.001 |
| 512.42 | 0 |
| 512.64 | 0 |
| 512.87 | 0 |
| 513.09 | 0.002 |
| 513.32 | -0.002 |
| 513.54 | 0.001 |
| 513.77 | -0.002 |
| 513.99 | 0.001 |
| 514.22 | 0.002 |
| 514.44 | 0.001 |
| 514.67 | -0.001 |
| 514.89 | 0 |
| 515.12 | 0 |
| 515.34 | 0 |
| 515.57 | -0.002 |
| 515.8 | 0.002 |
| 516.02 | 0 |
| 516.25 | 0.001 |
| 516.47 | 0 |
| 516.7 | -0.001 |
| 516.92 | 0 |
| 517.15 | 0.001 |
| 517.37 | 0.001 |
| 517.6 | -0.001 |
| 517.82 | -0.001 |
| 518.05 | -0.001 |
| 518.27 | 0 |
| 518.5 | -0.001 |
| 518.73 | 0.002 |
| 518.95 | -0.003 |
| 519.18 | -0.001 |
| 519.4 | -0.002 |
| 519.63 | 0.001 |
| 519.85 | -0.001 |
| 520.08 | 0.002 |
| 520.3 | -0.002 |
| 520.53 | -0.001 |
| 520.76 | -0.001 |
| 520.98 | 0.002 |
| 521.21 | 0 |
| 521.43 | 0 |
| 521.66 | 0 |
| 521.88 | 0 |
| 522.11 | -0.001 |
| 522.34 | 0 |
| 522.56 | 0 |
| 522.79 | 0 |
| 523.01 | -0.001 |
| 523.24 | -0.001 |
| 523.46 | -0.001 |
| 523.69 | -0.001 |
| 523.92 | -0.003 |
| 524.14 | 0 |
| 524.37 | -0.002 |
| 524.59 | 0 |
| 524.82 | -0.002 |
| 525.05 | -0.002 |
| 525.27 | 0 |
| 525.5 | 0 |
| 525.72 | -0.001 |
| 525.95 | 0.002 |
| 526.17 | -0.001 |
| 526.4 | 0.001 |
| 526.63 | -0.003 |
| 526.85 | 0 |
| 527.08 | 0 |
| 527.3 | 0.001 |
| 527.53 | -0.002 |
| 527.76 | 0.001 |
| 527.98 | 0 |
| 528.21 | 0 |
| 528.43 | -0.001 |
| 528.66 | 0 |
| 528.89 | 0 |
| 529.11 | 0.001 |
| 529.34 | -0.001 |
| 529.56 | -0.001 |
| 529.79 | -0.002 |
| 530.02 | 0 |
| 530.24 | 0 |
| 530.47 | 0 |
| 530.7 | 0.001 |
| 530.92 | -0.002 |
| 531.15 | -0.001 |
| 531.37 | -0.001 |
| 531.6 | -0.002 |
| 531.83 | -0.002 |
| 532.05 | -0.001 |
| 532.28 | -0.001 |
| 532.51 | -0.002 |
| 532.73 | -0.002 |
| 532.96 | -0.002 |
| 533.18 | 0.001 |
| 533.41 | -0.002 |
| 533.64 | 0.001 |
| 533.86 | -0.001 |
| 534.09 | -0.001 |
| 534.32 | 0 |
| 534.54 | 0 |
| 534.77 | -0.001 |
| 535.0 | 0.002 |
| 535.22 | -0.001 |
| 535.45 | 0 |
| 535.67 | 0.001 |
| 535.9 | 0.002 |
| 536.13 | -0.002 |
| 536.35 | -0.001 |
| 536.58 | -0.002 |
| 536.81 | 0.001 |
| 537.03 | -0.002 |
| 537.26 | -0.001 |
| 537.49 | -0.002 |
| 537.71 | -0.001 |
| 537.94 | -0.002 |
| 538.17 | -0.002 |
| 538.39 | 0.001 |
| 538.62 | -0.002 |
| 538.85 | -0.002 |
| 539.07 | -0.002 |
| 539.3 | -0.002 |
| 539.53 | -0.001 |
| 539.75 | 0 |
| 539.98 | 0.001 |
| 540.21 | 0 |
| 540.43 | 0 |
| 540.66 | -0.002 |
| 540.89 | 0 |
| 541.11 | 0.001 |
| 541.34 | -0.001 |
| 541.57 | -0.001 |
| 541.79 | -0.001 |
| 542.02 | 0.001 |
| 542.25 | -0.001 |
| 542.47 | 0.002 |
| 542.7 | 0 |
| 542.93 | -0.005 |
| 543.15 | -0.002 |
| 543.38 | -0.002 |
| 543.61 | 0.002 |
| 543.83 | 0 |
| 544.06 | 0.001 |
| 544.29 | -0.001 |
| 544.51 | -0.001 |
| 544.74 | 0 |
| 544.97 | 0.001 |
| 545.2 | -0.001 |
| 545.42 | 0 |
| 545.65 | -0.001 |
| 545.88 | 0 |
| 546.1 | -0.001 |
| 546.33 | 0 |
| 546.56 | -0.001 |
| 546.78 | 0.002 |
| 547.01 | 0.002 |
| 547.24 | 0.003 |
| 547.47 | 0.001 |
| 547.69 | -0.001 |
| 547.92 | 0.001 |
| 548.15 | 0.001 |
| 548.37 | -0.001 |
| 548.6 | -0.002 |
| 548.83 | -0.001 |
| 549.06 | -0.001 |
| 549.28 | -0.001 |
| 549.51 | 0.001 |
| 549.74 | 0.001 |
| 549.96 | 0 |
| 550.19 | -0.001 |
| 550.42 | 0 |
| 550.65 | -0.002 |
| 550.87 | 0.002 |
| 551.1 | 0 |
| 551.33 | -0.001 |
| 551.55 | 0 |
| 551.78 | 0 |
| 552.01 | -0.002 |
| 552.24 | 0 |
| 552.46 | -0.002 |
| 552.69 | 0 |
| 552.92 | -0.002 |
| 553.15 | 0 |
| 553.37 | -0.001 |
| 553.6 | 0 |
| 553.83 | -0.002 |
| 554.06 | -0.002 |
| 554.28 | 0 |
| 554.51 | 0 |
| 554.74 | 0.001 |
| 554.97 | 0 |
| 555.19 | -0.002 |
| 555.42 | 0 |
| 555.65 | 0 |
| 555.87 | -0.002 |
| 556.1 | 0 |
| 556.33 | 0 |
| 556.56 | 0.001 |
| 556.79 | 0 |
| 557.01 | 0 |
| 557.24 | 0.002 |
| 557.47 | 0 |
| 557.7 | 0.002 |
| 557.92 | -0.001 |
| 558.15 | 0 |
| 558.38 | -0.001 |
| 558.61 | 0.001 |
| 558.83 | -0.001 |
| 559.06 | 0 |
| 559.29 | 0.002 |
| 559.52 | -0.001 |
| 559.74 | -0.001 |
| 559.97 | 0.002 |
| 560.2 | 0.001 |
| 560.43 | 0 |
| 560.66 | -0.001 |
| 560.88 | 0.002 |
| 561.11 | -0.001 |
| 561.34 | 0 |
| 561.57 | -0.001 |
| 561.79 | 0.002 |
| 562.02 | -0.002 |
| 562.25 | -0.001 |
| 562.48 | -0.002 |
| 562.71 | 0.001 |
| 562.93 | 0.001 |
| 563.16 | 0.002 |
| 563.39 | 0 |
| 563.62 | -0.001 |
| 563.84 | 0 |
| 564.07 | -0.001 |
| 564.3 | -0.001 |
| 564.53 | 0 |
| 564.76 | -0.002 |
| 564.98 | 0.001 |
| 565.21 | 0 |
| 565.44 | -0.001 |
| 565.67 | 0.001 |
| 565.9 | 0.002 |
| 566.12 | 0 |
| 566.35 | 0.001 |
| 566.58 | 0 |
| 566.81 | 0.003 |
| 567.04 | 0 |
| 567.26 | 0 |
| 567.49 | -0.001 |
| 567.72 | 0.001 |
| 567.95 | -0.002 |
| 568.18 | -0.002 |
| 568.41 | -0.003 |
| 568.63 | -0.002 |
| 568.86 | -0.001 |
| 569.09 | 0.001 |
| 569.32 | 0 |
| 569.55 | -0.001 |
| 569.77 | -0.002 |
| 570.0 | 0 |
| 570.23 | -0.001 |
| 570.46 | 0 |
| 570.69 | 0.002 |
| 570.92 | 0 |
| 571.14 | -0.001 |
| 571.37 | 0.001 |
| 571.6 | 0.001 |
| 571.83 | 0.002 |
| 572.06 | -0.001 |
| 572.29 | 0 |
| 572.51 | 0 |
| 572.74 | 0.003 |
| 572.97 | 0.002 |
| 573.2 | 0 |
| 573.43 | 0.001 |
| 573.66 | 0 |
| 573.88 | 0.001 |
| 574.11 | 0 |
| 574.34 | 0.002 |
| 574.57 | 0.004 |
| 574.8 | 0 |
| 575.03 | 0.002 |
| 575.26 | 0.003 |
| 575.48 | 0.002 |
| 575.71 | 0.002 |
| 575.94 | 0.001 |
| 576.17 | 0.003 |
| 576.4 | 0.007 |
| 576.63 | 0.006 |
| 576.85 | 0.008 |
| 577.08 | 0.008 |
| 577.31 | 0.01 |
| 577.54 | 0.01 |
| 577.77 | 0.014 |
| 578.0 | 0.016 |
| 578.23 | 0.019 |
| 578.46 | 0.017 |
| 578.68 | 0.022 |
| 578.91 | 0.023 |
| 579.14 | 0.034 |
| 579.37 | 0.036 |
| 579.6 | 0.043 |
| 579.83 | 0.044 |
| 580.06 | 0.052 |
| 580.28 | 0.054 |
| 580.51 | 0.066 |
| 580.74 | 0.068 |
| 580.97 | 0.083 |
| 581.2 | 0.077 |
| 581.43 | 0.088 |
| 581.66 | 0.092 |
| 581.89 | 0.104 |
| 582.12 | 0.103 |
| 582.34 | 0.117 |
| 582.57 | 0.123 |
| 582.8 | 0.138 |
| 583.03 | 0.138 |
| 583.26 | 0.152 |
| 583.49 | 0.16 |
| 583.72 | 0.173 |
| 583.95 | 0.176 |
| 584.18 | 0.19 |
| 584.4 | 0.195 |
| 584.63 | 0.209 |
| 584.86 | 0.214 |
| 585.09 | 0.233 |
| 585.32 | 0.234 |
| 585.55 | 0.257 |
| 585.78 | 0.253 |
| 586.01 | 0.269 |
| 586.24 | 0.279 |
| 586.47 | 0.304 |
| 586.69 | 0.31 |
| 586.92 | 0.33 |
| 587.15 | 0.334 |
| 587.38 | 0.353 |
| 587.61 | 0.357 |
| 587.84 | 0.38 |
| 588.07 | 0.387 |
| 588.3 | 0.412 |
| 588.53 | 0.411 |
| 588.76 | 0.446 |
| 588.99 | 0.448 |
| 589.21 | 0.467 |
| 589.44 | 0.483 |
| 589.67 | 0.505 |
| 589.9 | 0.513 |
| 590.13 | 0.53 |
| 590.36 | 0.543 |
| 590.59 | 0.579 |
| 590.82 | 0.584 |
| 591.05 | 0.605 |
| 591.28 | 0.616 |
| 591.51 | 0.648 |
| 591.74 | 0.662 |
| 591.97 | 0.679 |
| 592.19 | 0.699 |
| 592.42 | 0.72 |
| 592.65 | 0.731 |
| 592.88 | 0.758 |
| 593.11 | 0.771 |
| 593.34 | 0.791 |
| 593.57 | 0.809 |
| 593.8 | 0.835 |
| 594.03 | 0.843 |
| 594.26 | 0.866 |
| 594.49 | 0.884 |
| 594.72 | 0.909 |
| 594.95 | 0.915 |
| 595.18 | 0.943 |
| 595.41 | 0.936 |
| 595.64 | 0.969 |
| 595.87 | 0.972 |
| 596.1 | 0.98 |
| 596.32 | 0.977 |
| 596.55 | 1 |
| 596.78 | 0.993 |
| 597.01 | 0.99 |
| 597.24 | 0.99 |
| 597.47 | 0.983 |
| 597.7 | 0.99 |
| 597.93 | 0.991 |
| 598.16 | 0.977 |
| 598.39 | 0.979 |
| 598.62 | 0.958 |
| 598.85 | 0.94 |
| 599.08 | 0.925 |
| 599.31 | 0.923 |
| 599.54 | 0.896 |
| 599.77 | 0.881 |
| 600.0 | 0.864 |
| 600.23 | 0.845 |
| 600.46 | 0.82 |
| 600.69 | 0.8 |
| 600.92 | 0.775 |
| 601.15 | 0.751 |
| 601.38 | 0.727 |
| 601.61 | 0.704 |
| 601.84 | 0.667 |
| 602.07 | 0.647 |
| 602.3 | 0.623 |
| 602.53 | 0.605 |
| 602.76 | 0.575 |
| 602.99 | 0.563 |
| 603.22 | 0.53 |
| 603.45 | 0.508 |
| 603.68 | 0.487 |
| 603.91 | 0.469 |
| 604.14 | 0.436 |
| 604.36 | 0.413 |
| 604.59 | 0.397 |
| 604.82 | 0.381 |
| 605.05 | 0.353 |
| 605.28 | 0.343 |
| 605.51 | 0.321 |
| 605.74 | 0.302 |
| 605.97 | 0.283 |
| 606.2 | 0.278 |
| 606.43 | 0.253 |
| 606.66 | 0.24 |
| 606.89 | 0.219 |
| 607.12 | 0.21 |
| 607.35 | 0.193 |
| 607.58 | 0.185 |
| 607.81 | 0.165 |
| 608.05 | 0.159 |
| 608.28 | 0.14 |
| 608.51 | 0.139 |
| 608.74 | 0.116 |
| 608.97 | 0.112 |
| 609.2 | 0.095 |
| 609.43 | 0.087 |
| 609.66 | 0.077 |
| 609.89 | 0.075 |
| 610.12 | 0.055 |
| 610.35 | 0.052 |
| 610.58 | 0.045 |
| 610.81 | 0.04 |
| 611.04 | 0.031 |
| 611.27 | 0.027 |
| 611.5 | 0.024 |
| 611.73 | 0.019 |
| 611.96 | 0.012 |
| 612.19 | 0.014 |
| 612.42 | 0.01 |
| 612.65 | 0.01 |
| 612.88 | 0.004 |
| 613.11 | 0.005 |
| 613.34 | 0.004 |
| 613.57 | 0.003 |
| 613.8 | 0.003 |
| 614.03 | 0.001 |
| 614.26 | 0.003 |
| 614.49 | 0.002 |
| 614.72 | 0.003 |
| 614.95 | -0.001 |
| 615.18 | 0 |
| 615.41 | 0.001 |
| 615.64 | 0 |
| 615.87 | 0.002 |
| 616.1 | 0.003 |
| 616.34 | 0 |
| 616.57 | 0.001 |
| 616.8 | -0.001 |
| 617.03 | 0.002 |
| 617.26 | 0.001 |
| 617.49 | 0.001 |
| 617.72 | -0.001 |
| 617.95 | -0.002 |
| 618.18 | -0.001 |
| 618.41 | 0 |
| 618.64 | -0.001 |
| 618.87 | -0.001 |
| 619.1 | -0.002 |
| 619.33 | 0 |
| 619.56 | -0.003 |
| 619.79 | 0 |
| 620.02 | 0 |
| 620.26 | 0.003 |
| 620.49 | 0 |
| 620.72 | 0.001 |
| 620.95 | 0 |
| 621.18 | 0.001 |
| 621.41 | -0.002 |
| 621.64 | -0.001 |
| 621.87 | -0.001 |
| 622.1 | 0 |
| 622.33 | -0.002 |
| 622.56 | -0.001 |
| 622.79 | 0.001 |
| 623.02 | 0 |
| 623.25 | 0.001 |
| 623.49 | 0.001 |
| 623.72 | -0.002 |
| 623.95 | 0 |
| 624.18 | -0.001 |
| 624.41 | 0 |
| 624.64 | 0 |
| 624.87 | 0.001 |
| 625.1 | -0.002 |
| 625.33 | -0.002 |
| 625.56 | -0.003 |
| 625.79 | 0.001 |
| 626.03 | -0.002 |
| 626.26 | -0.001 |
| 626.49 | 0 |
| 626.72 | 0 |
| 626.95 | -0.002 |
| 627.18 | 0 |
| 627.41 | -0.003 |
| 627.64 | -0.001 |
| 627.87 | -0.001 |
| 628.1 | 0.002 |
| 628.33 | -0.002 |
| 628.57 | 0.001 |
| 628.8 | 0.001 |
| 629.03 | 0.001 |
| 629.26 | -0.001 |
| 629.49 | 0.001 |
| 629.72 | -0.001 |
| 629.95 | -0.002 |
| 630.18 | -0.001 |
| 630.41 | -0.001 |
| 630.65 | 0 |
| 630.88 | 0 |
| 631.11 | -0.001 |
| 631.34 | 0.001 |
| 631.57 | -0.001 |
| 631.8 | -0.001 |
| 632.03 | 0 |
| 632.26 | 0 |
| 632.5 | -0.002 |
| 632.73 | -0.001 |
| 632.96 | -0.001 |
| 633.19 | 0.001 |
| 633.42 | -0.001 |
| 633.65 | -0.002 |
| 633.88 | 0.002 |
| 634.11 | -0.001 |
| 634.35 | -0.001 |
| 634.58 | -0.002 |
| 634.81 | 0 |
| 635.04 | -0.002 |
| 635.27 | 0 |
| 635.5 | -0.001 |
| 635.73 | -0.001 |
| 635.96 | 0 |
| 636.2 | 0.001 |
| 636.43 | 0 |
| 636.66 | 0.001 |
| 636.89 | 0 |
| 637.12 | -0.002 |
| 637.35 | -0.001 |
| 637.58 | -0.001 |
| 637.82 | 0 |
| 638.05 | -0.001 |
| 638.28 | -0.001 |
| 638.51 | -0.002 |
| 638.74 | 0.001 |
| 638.97 | -0.001 |
| 639.21 | 0.002 |
| 639.44 | 0.001 |
| 639.67 | -0.002 |
| 639.9 | 0 |
| 640.13 | 0.001 |
| 640.36 | -0.001 |
| 640.59 | -0.003 |
| 640.83 | 0.002 |
| 641.06 | 0 |
| 641.29 | 0 |
| 641.52 | 0.001 |
| 641.75 | -0.001 |
| 641.98 | 0.003 |
| 642.22 | 0.001 |
| 642.45 | -0.002 |
| 642.68 | 0 |
| 642.91 | -0.001 |
| 643.14 | -0.002 |
| 643.37 | 0 |
| 643.61 | 0.001 |
| 643.84 | -0.001 |
| 644.07 | -0.001 |
| 644.3 | 0 |
| 644.53 | 0.001 |
| 644.76 | 0.001 |
| 645.0 | 0.002 |
| 645.23 | 0.001 |
| 645.46 | 0.001 |
| 645.69 | 0 |
| 645.92 | -0.001 |
| 646.16 | -0.002 |
| 646.39 | 0 |
| 646.62 | -0.002 |
| 646.85 | -0.002 |
| 647.08 | -0.002 |
| 647.31 | 0.001 |
| 647.55 | -0.002 |
| 647.78 | 0.003 |
| 648.01 | -0.001 |
| 648.24 | 0 |
| 648.47 | -0.001 |
| 648.71 | 0 |
| 648.94 | 0 |
| 649.17 | 0 |
| 649.4 | 0 |
| 649.63 | 0.003 |
| 649.87 | -0.002 |
| 650.1 | 0 |
| 650.33 | -0.001 |
| 650.56 | 0.002 |
| 650.79 | 0.002 |
| 651.03 | 0.002 |
| 651.26 | 0 |
| 651.49 | -0.001 |
| 651.72 | -0.003 |
| 651.95 | 0.002 |
| 652.19 | -0.003 |
| 652.42 | 0.001 |
| 652.65 | -0.001 |
| 652.88 | -0.001 |
| 653.12 | 0.002 |
| 653.35 | -0.002 |
| 653.58 | -0.001 |
| 653.81 | 0 |
| 654.04 | 0.001 |
| 654.28 | -0.001 |
| 654.51 | -0.002 |
| 654.74 | 0 |
| 654.97 | -0.002 |
| 655.2 | 0.001 |
| 655.44 | 0.001 |
| 655.67 | -0.002 |
| 655.9 | -0.001 |
| 656.13 | 0 |
| 656.37 | 0.001 |
| 656.6 | 0.001 |
| 656.83 | -0.002 |
| 657.06 | 0 |
| 657.3 | 0.001 |
| 657.53 | 0 |
| 657.76 | -0.002 |
| 657.99 | 0.001 |
| 658.22 | 0 |
| 658.46 | 0.001 |
| 658.69 | 0 |
| 658.92 | 0.002 |
| 659.15 | -0.001 |
| 659.39 | 0 |
| 659.62 | -0.003 |
| 659.85 | 0.001 |
| 660.08 | -0.003 |
| 660.32 | -0.001 |
| 660.55 | 0.002 |
| 660.78 | 0.001 |
| 661.01 | 0 |
| 661.25 | 0.001 |
| 661.48 | 0 |
| 661.71 | 0.001 |
| 661.94 | 0 |
| 662.18 | 0 |
| 662.41 | -0.001 |
| 662.64 | 0.001 |
| 662.87 | 0.001 |
| 663.11 | 0 |
| 663.34 | -0.001 |
| 663.57 | 0.001 |
| 663.8 | 0 |
| 664.04 | 0.001 |
| 664.27 | -0.002 |
| 664.5 | 0.002 |
| 664.73 | 0 |
| 664.97 | 0.001 |
| 665.2 | -0.003 |
| 665.43 | 0 |
| 665.67 | 0.001 |
| 665.9 | 0.001 |
| 666.13 | -0.002 |
| 666.36 | -0.001 |
| 666.6 | -0.002 |
| 666.83 | 0 |
| 667.06 | 0 |
| 667.29 | 0 |
| 667.53 | -0.001 |
| 667.76 | 0.001 |
| 667.99 | 0.001 |
| 668.23 | 0 |
| 668.46 | -0.002 |
| 668.69 | 0.001 |
| 668.92 | 0.003 |
| 669.16 | -0.001 |
| 669.39 | 0.001 |
| 669.62 | -0.001 |
| 669.86 | -0.001 |
| 670.09 | 0.001 |
| 670.32 | -0.001 |
| 670.55 | -0.002 |
| 670.79 | -0.002 |
| 671.02 | 0.001 |
| 671.25 | -0.003 |
| 671.49 | -0.001 |
| 671.72 | -0.001 |
| 671.95 | 0.001 |
| 672.18 | 0.001 |
| 672.42 | 0.001 |
| 672.65 | 0 |
| 672.88 | 0.001 |
| 673.12 | 0 |
| 673.35 | 0.001 |
| 673.58 | 0.002 |
| 673.82 | -0.002 |
| 674.05 | -0.003 |
| 674.28 | -0.002 |
| 674.51 | -0.003 |
| 674.75 | 0 |
| 674.98 | -0.001 |
| 675.21 | -0.002 |
| 675.45 | 0.002 |
| 675.68 | -0.001 |
| 675.91 | 0 |
| 676.15 | -0.001 |
| 676.38 | 0.001 |
| 676.61 | 0.001 |
| 676.85 | -0.002 |
| 677.08 | 0.001 |
| 677.31 | -0.001 |
| 677.54 | 0 |
| 677.78 | 0.001 |
| 678.01 | 0.003 |
| 678.24 | -0.001 |
| 678.48 | 0.001 |
| 678.71 | -0.001 |
| 678.94 | -0.001 |
| 679.18 | 0.002 |
| 679.41 | 0 |
| 679.64 | -0.001 |
| 679.88 | 0.002 |
| 680.11 | -0.002 |
| 680.34 | -0.001 |
| 680.58 | 0.001 |
| 680.81 | -0.001 |
| 681.04 | -0.001 |
| 681.28 | -0.001 |
| 681.51 | 0.001 |
| 681.74 | 0 |
| 681.98 | 0 |
| 682.21 | -0.001 |
| 682.44 | -0.001 |
| 682.68 | 0.002 |
| 682.91 | -0.003 |
| 683.14 | 0.003 |
| 683.38 | -0.001 |
| 683.61 | 0 |
| 683.84 | 0 |
| 684.08 | 0 |
| 684.31 | -0.001 |
| 684.54 | 0.002 |
| 684.78 | -0.001 |
| 685.01 | -0.002 |
| 685.25 | -0.001 |
| 685.48 | -0.001 |
| 685.71 | -0.001 |
| 685.95 | -0.001 |
| 686.18 | -0.002 |
| 686.41 | 0 |
| 686.65 | -0.001 |
| 686.88 | -0.003 |
| 687.11 | -0.003 |
| 687.35 | 0.001 |
| 687.58 | 0 |
| 687.81 | 0 |
| 688.05 | -0.001 |
| 688.28 | -0.001 |
| 688.52 | -0.001 |
| 688.75 | 0 |
| 688.98 | 0.002 |
| 689.22 | 0.001 |
| 689.45 | 0 |
| 689.68 | 0.002 |
| 689.92 | 0.001 |
| 690.15 | -0.001 |
| 690.38 | 0 |
| 690.62 | 0.002 |
| 690.85 | 0 |
| 691.09 | 0.001 |
| 691.32 | 0 |
| 691.55 | 0 |
| 691.79 | -0.002 |
| 692.02 | 0.001 |
| 692.25 | -0.001 |
| 692.49 | -0.001 |
| 692.72 | -0.003 |
| 692.96 | 0.002 |
| 693.19 | 0.002 |
| 693.42 | -0.001 |
| 693.66 | 0.004 |
| 693.89 | -0.001 |
| 694.12 | -0.002 |
| 694.36 | -0.003 |
| 694.59 | 0.001 |
| 694.83 | -0.001 |
| 695.06 | -0.002 |
| 695.29 | 0 |
| 695.53 | 0 |
| 695.76 | -0.002 |
| 696.0 | -0.001 |
| 696.23 | -0.002 |
| 696.46 | 0 |
| 696.7 | 0 |
| 696.93 | -0.001 |
| 697.17 | -0.001 |
| 697.4 | 0.003 |
| 697.63 | -0.001 |
| 697.87 | 0 |
| 698.1 | -0.001 |
| 698.34 | 0.002 |
| 698.57 | 0 |
| 698.8 | -0.003 |
| 699.04 | -0.001 |
| 699.27 | 0 |
| 699.51 | 0.001 |
| 699.74 | 0.002 |
| 699.97 | -0.001 |
| 700.21 | 0.001 |
| 700.44 | -0.001 |
| 700.68 | 0.002 |
| 700.91 | 0 |
| 701.14 | 0.002 |
| 701.38 | 0.001 |
| 701.61 | 0 |
| 701.85 | -0.001 |
| 702.08 | 0.002 |
| 702.32 | -0.001 |
| 702.55 | 0 |
| 702.78 | -0.001 |
| 703.02 | -0.001 |
| 703.25 | -0.002 |
| 703.49 | 0 |
| 703.72 | -0.002 |
| 703.96 | 0.001 |
| 704.19 | -0.001 |
| 704.42 | 0.001 |
| 704.66 | 0.001 |
| 704.89 | 0 |
| 705.13 | 0 |
| 705.36 | 0 |
| 705.6 | -0.001 |
| 705.83 | -0.001 |
| 706.06 | -0.002 |
| 706.3 | 0.001 |
| 706.53 | -0.001 |
| 706.77 | -0.001 |
| 707.0 | -0.001 |
| 707.24 | 0 |
| 707.47 | -0.001 |
| 707.7 | 0.002 |
| 707.94 | -0.002 |
| 708.17 | -0.001 |
| 708.41 | -0.002 |
| 708.64 | -0.001 |
| 708.88 | 0.001 |
| 709.11 | -0.001 |
| 709.35 | -0.001 |
| 709.58 | -0.001 |
| 709.81 | 0 |
| 710.05 | 0 |
| 710.28 | 0 |
| 710.52 | -0.001 |
| 710.75 | 0.002 |
| 710.99 | 0.001 |
| 711.22 | 0 |
| 711.46 | 0 |
| 711.69 | 0.001 |
| 711.92 | 0.001 |
| 712.16 | -0.001 |
| 712.39 | -0.002 |
| 712.63 | 0 |
| 712.86 | -0.001 |
| 713.1 | 0 |
| 713.33 | -0.003 |
| 713.57 | 0 |
| 713.8 | 0.001 |
| 714.04 | -0.002 |
| 714.27 | 0.001 |
| 714.51 | 0.001 |
| 714.74 | 0.002 |
| 714.97 | 0 |
| 715.21 | 0 |
| 715.44 | -0.001 |
| 715.68 | 0.002 |
| 715.91 | -0.003 |
| 716.15 | 0.001 |
| 716.38 | 0 |
| 716.62 | -0.001 |
| 716.85 | -0.001 |
| 717.09 | 0.002 |
| 717.32 | -0.002 |
| 717.56 | -0.001 |
| 717.79 | 0 |
| 718.03 | 0.001 |
| 718.26 | 0.002 |
| 718.5 | 0.001 |
| 718.73 | -0.001 |
| 718.97 | 0 |
| 719.2 | 0 |
| 719.44 | -0.002 |
| 719.67 | -0.001 |
| 719.91 | -0.001 |
| 720.14 | -0.001 |
| 720.37 | 0.002 |
| 720.61 | 0.001 |
| 720.84 | 0 |
| 721.08 | -0.001 |
| 721.31 | 0.002 |
| 721.55 | -0.001 |
| 721.78 | 0.001 |
| 722.02 | 0 |
| 722.25 | -0.001 |
| 722.49 | -0.001 |
| 722.72 | 0.001 |
| 722.96 | 0.001 |
| 723.19 | -0.001 |
| 723.43 | -0.001 |
| 723.66 | 0.001 |
| 723.9 | 0 |
| 724.13 | 0.001 |
| 724.37 | -0.001 |
| 724.6 | -0.002 |
| 724.84 | 0.001 |
| 725.07 | -0.001 |
| 725.31 | 0.001 |
| 725.54 | 0 |
| 725.78 | 0.001 |
| 726.01 | -0.002 |
| 726.25 | -0.001 |
| 726.48 | 0 |
| 726.72 | -0.002 |
| 726.96 | 0.001 |
| 727.19 | -0.003 |
| 727.43 | 0.001 |
| 727.66 | 0.001 |
| 727.9 | -0.002 |
| 728.13 | 0.007 |
| 728.37 | -0.001 |
| 728.6 | -0.003 |
| 728.84 | 0 |
| 729.07 | 0.001 |
| 729.31 | -0.001 |
| 729.54 | 0.001 |
| 729.78 | 0 |
| 730.01 | -0.001 |
| 730.25 | 0.001 |
| 730.48 | 0 |
| 730.72 | 0.002 |
| 730.95 | -0.001 |
| 731.19 | 0.001 |
| 731.42 | 0.001 |
| 731.66 | 0.001 |
| 731.89 | -0.001 |
| 732.13 | -0.001 |
| 732.37 | -0.001 |
| 732.6 | -0.001 |
| 732.84 | -0.002 |
| 733.07 | 0.002 |
| 733.31 | 0 |
| 733.54 | 0 |
| 733.78 | 0 |
| 734.01 | 0.001 |
| 734.25 | -0.001 |
| 734.48 | -0.002 |
| 734.72 | -0.001 |
| 734.95 | -0.001 |
| 735.19 | -0.001 |
| 735.43 | -0.001 |
| 735.66 | 0 |
| 735.9 | 0.002 |
| 736.13 | -0.001 |
| 736.37 | 0.002 |
| 736.6 | 0 |
| 736.84 | 0 |
| 737.07 | -0.001 |
| 737.31 | 0 |
| 737.55 | -0.003 |
| 737.78 | 0 |
| 738.02 | 0 |
| 738.25 | -0.001 |
| 738.49 | -0.001 |
| 738.72 | 0 |
| 738.96 | -0.001 |
| 739.19 | 0 |
| 739.43 | -0.001 |
| 739.67 | 0 |
| 739.9 | 0.003 |
| 740.14 | 0.002 |
| 740.37 | -0.002 |
| 740.61 | 0 |
| 740.84 | 0 |
| 741.08 | 0.001 |
| 741.31 | -0.002 |
| 741.55 | 0.001 |
| 741.79 | -0.001 |
| 742.02 | 0.002 |
| 742.26 | 0 |
| 742.49 | 0.001 |
| 742.73 | 0.002 |
| 742.96 | -0.001 |
| 743.2 | 0.001 |
| 743.44 | 0.002 |
| 743.67 | -0.001 |
| 743.91 | -0.001 |
| 744.14 | 0 |
| 744.38 | -0.001 |
| 744.61 | 0 |
| 744.85 | 0 |
| 745.09 | 0.001 |
| 745.32 | 0 |
| 745.56 | -0.001 |
| 745.79 | -0.001 |
| 746.03 | 0.001 |
| 746.27 | -0.003 |
| 746.5 | -0.001 |
| 746.74 | 0 |
| 746.97 | -0.001 |
| 747.21 | 0.002 |
| 747.44 | -0.001 |
| 747.68 | 0.002 |
| 747.92 | 0 |
| 748.15 | 0 |
| 748.39 | 0.002 |
| 748.62 | 0.001 |
| 748.86 | -0.002 |
| 749.1 | 0 |
| 749.33 | -0.001 |
| 749.57 | 0 |
| 749.8 | -0.001 |
| 750.04 | -0.002 |
| 750.28 | 0 |
| 750.51 | -0.001 |
| 750.75 | 0.001 |
| 750.98 | 0 |
| 751.22 | -0.001 |
| 751.46 | 0 |
| 751.69 | -0.002 |
| 751.93 | -0.001 |
| 752.16 | -0.003 |
| 752.4 | -0.001 |
| 752.64 | -0.001 |
| 752.87 | 0.002 |
| 753.11 | 0 |
| 753.34 | 0.001 |
| 753.58 | 0.001 |
| 753.82 | -0.001 |
| 754.05 | 0.002 |
| 754.29 | -0.002 |
| 754.53 | 0.001 |
| 754.76 | -0.001 |
| 755.0 | 0.001 |
| 755.23 | 0 |
| 755.47 | 0.001 |
| 755.71 | 0.002 |
| 755.94 | 0 |
| 756.18 | -0.001 |
| 756.41 | 0 |
| 756.65 | 0.001 |
| 756.89 | 0 |
| 757.12 | -0.002 |
| 757.36 | 0 |
| 757.6 | 0 |
| 757.83 | -0.001 |
| 758.07 | 0 |
| 758.3 | 0.002 |
| 758.54 | -0.001 |
| 758.78 | 0.001 |
| 759.01 | 0 |
| 759.25 | -0.001 |
| 759.49 | 0 |
| 759.72 | 0.003 |
| 759.96 | -0.001 |
| 760.2 | 0.002 |
| 760.43 | -0.001 |
| 760.67 | 0 |
| 760.9 | 0 |
| 761.14 | 0 |
| 761.38 | -0.001 |
| 761.61 | 0.003 |
| 761.85 | 0 |
| 762.09 | 0.002 |
| 762.32 | 0 |
| 762.56 | -0.001 |
| 762.8 | 0 |
| 763.03 | 0.003 |
| 763.27 | 0 |
| 763.5 | 0.001 |
| 763.74 | -0.001 |
| 763.98 | -0.002 |
| 764.21 | -0.003 |
| 764.45 | 0 |
| 764.69 | -0.002 |
| 764.92 | -0.002 |
| 765.16 | -0.003 |
| 765.4 | 0.002 |
| 765.63 | 0 |
| 765.87 | 0 |
| 766.11 | -0.003 |
| 766.34 | 0.001 |
| 766.58 | -0.002 |
| 766.82 | 0 |
| 767.05 | 0.001 |
| 767.29 | 0.001 |
| 767.53 | -0.001 |
| 767.76 | -0.002 |
| 768.0 | 0.001 |
| 768.24 | -0.001 |
| 768.47 | -0.001 |
| 768.71 | 0.001 |
| 768.95 | 0.002 |
| 769.18 | -0.001 |
| 769.42 | -0.002 |
| 769.66 | 0.001 |
| 769.89 | -0.001 |
| 770.13 | 0.001 |
| 770.37 | -0.001 |
| 770.6 | -0.001 |
| 770.84 | 0 |
| 771.08 | -0.001 |
| 771.31 | 0 |
| 771.55 | -0.001 |
| 771.79 | -0.003 |
| 772.02 | 0 |
| 772.26 | -0.002 |
| 772.5 | 0.003 |
| 772.73 | -0.002 |
| 772.97 | 0 |
| 773.21 | -0.001 |
| 773.44 | 0 |
| 773.68 | -0.001 |
| 773.92 | 0 |
| 774.15 | 0 |
| 774.39 | -0.001 |
| 774.63 | -0.001 |
| 774.86 | 0.002 |
| 775.1 | 0 |
| 775.34 | -0.001 |
| 775.57 | -0.001 |
| 775.81 | 0.004 |
| 776.05 | -0.002 |
| 776.29 | 0.001 |
| 776.52 | -0.001 |
| 776.76 | 0.001 |
| 777.0 | 0.001 |
| 777.23 | -0.001 |
| 777.47 | 0.001 |
| 777.71 | 0.004 |
| 777.94 | -0.001 |
| 778.18 | 0.002 |
| 778.42 | -0.001 |
| 778.65 | 0.002 |
| 778.89 | 0.001 |
| 779.13 | -0.003 |
| 779.37 | -0.001 |
| 779.6 | -0.001 |
| 779.84 | 0 |
| 780.08 | -0.001 |
| 780.31 | -0.001 |
| 780.55 | 0.002 |
| 780.79 | 0 |
| 781.02 | -0.002 |
| 781.26 | 0.001 |
| 781.5 | 0.001 |
| 781.74 | -0.001 |
| 781.97 | -0.002 |
| 782.21 | 0 |
| 782.45 | 0 |
| 782.68 | -0.002 |
| 782.92 | 0.001 |
| 783.16 | -0.001 |
| 783.4 | 0.001 |
| 783.63 | -0.001 |
| 783.87 | 0.002 |
| 784.11 | 0.003 |
| 784.34 | 0 |
| 784.58 | 0 |
| 784.82 | 0 |
| 785.06 | -0.001 |
| 785.29 | 0.001 |
| 785.53 | -0.001 |
| 785.77 | 0 |
| 786.0 | -0.003 |
| 786.24 | -0.001 |
| 786.48 | -0.002 |
| 786.72 | 0.002 |
| 786.95 | 0 |
| 787.19 | 0 |
| 787.43 | -0.001 |
| 787.67 | 0 |
| 787.9 | 0 |
| 788.14 | 0 |
| 788.38 | 0 |
| 788.61 | -0.001 |
| 788.85 | -0.001 |
| 789.09 | 0 |
| 789.33 | -0.001 |
| 789.56 | -0.001 |
| 789.8 | -0.001 |
| 790.04 | -0.002 |
| 790.28 | -0.001 |
| 790.51 | 0 |
| 790.75 | 0 |
| 790.99 | -0.002 |
| 791.23 | -0.001 |
| 791.46 | 0 |
| 791.7 | 0 |
| 791.94 | 0 |
| 792.17 | -0.001 |
| 792.41 | 0.002 |
| 792.65 | -0.002 |
| 792.89 | -0.002 |
| 793.12 | 0.001 |
| 793.36 | 0.002 |
| 793.6 | -0.001 |
| 793.84 | 0.001 |
| 794.07 | 0 |
| 794.31 | 0.001 |
| 794.55 | -0.001 |
| 794.79 | 0.001 |
| 795.02 | 0.001 |
| 795.26 | 0.001 |
| 795.5 | -0.003 |
| 795.74 | 0.001 |
| 795.97 | 0 |
| 796.21 | -0.001 |
| 796.45 | -0.001 |
| 796.69 | 0.001 |
| 796.92 | -0.002 |
| 797.16 | 0.001 |
| 797.4 | -0.002 |
| 797.64 | 0 |
| 797.88 | -0.001 |
| 798.11 | -0.001 |
| 798.35 | 0 |
| 798.59 | 0 |
| 798.83 | -0.002 |
| 799.06 | 0.001 |
| 799.3 | -0.002 |
| 799.54 | 0 |
| 799.78 | -0.001 |
| 800.01 | -0.001 |
| 800.25 | -0.001 |
| 800.49 | 0.001 |
| 800.73 | -0.001 |
| 800.96 | -0.001 |
| 801.2 | -0.002 |
| 801.44 | -0.002 |
| 801.68 | 0 |
| 801.92 | 0 |
| 802.15 | 0.002 |
| 802.39 | -0.001 |
| 802.63 | -0.001 |
| 802.87 | 0.001 |
| 803.1 | 0.001 |
| 803.34 | -0.001 |
| 803.58 | -0.001 |
| 803.82 | -0.001 |
| 804.06 | -0.001 |
| 804.29 | -0.001 |
| 804.53 | 0 |
| 804.77 | 0.001 |
| 805.01 | 0 |
| 805.24 | 0 |
| 805.48 | -0.001 |
| 805.72 | 0.001 |
| 805.96 | 0.001 |
| 806.2 | 0 |
| 806.43 | -0.001 |
| 806.67 | -0.001 |
| 806.91 | -0.001 |
| 807.15 | 0.002 |
| 807.39 | -0.001 |
| 807.62 | 0 |
| 807.86 | 0 |
| 808.1 | -0.001 |
| 808.34 | -0.001 |
| 808.58 | -0.002 |
| 808.81 | -0.001 |
| 809.05 | 0.001 |
| 809.29 | -0.001 |
| 809.53 | 0.001 |
| 809.76 | -0.002 |
| 810.0 | 0.001 |
| 810.24 | -0.001 |
| 810.48 | 0.001 |
| 810.72 | -0.002 |
| 810.95 | 0 |
| 811.19 | 0.001 |
| 811.43 | 0.001 |
| 811.67 | 0 |
| 811.91 | -0.001 |
| 812.15 | 0 |
| 812.38 | 0.001 |
| 812.62 | 0 |
| 812.86 | -0.001 |
| 813.1 | -0.002 |
| 813.34 | 0.001 |
| 813.57 | 0 |
| 813.81 | 0 |
| 814.05 | 0 |
| 814.29 | -0.001 |
| 814.53 | 0 |
| 814.76 | -0.001 |
| 815.0 | 0 |
| 815.24 | 0.003 |
| 815.48 | -0.001 |
| 815.72 | 0 |
| 815.95 | 0 |
| 816.19 | 0 |
| 816.43 | 0.001 |
| 816.67 | 0.002 |
| 816.91 | 0 |
| 817.15 | -0.002 |
| 817.38 | -0.002 |
| 817.62 | 0.001 |
| 817.86 | -0.001 |
| 818.1 | -0.002 |
| 818.34 | 0.001 |
| 818.58 | 0 |
| 818.81 | -0.001 |
| 819.05 | -0.002 |
| 819.29 | 0.001 |
| 819.53 | 0 |
| 819.77 | 0.001 |
| 820.0 | -0.001 |
| 820.24 | -0.001 |
| 820.48 | -0.001 |
| 820.72 | 0.001 |
| 820.96 | 0 |
| 821.2 | -0.001 |
| 821.43 | 0.002 |
| 821.67 | 0.002 |
| 821.91 | 0.002 |
| 822.15 | -0.001 |
| 822.39 | -0.002 |
| 822.63 | -0.001 |
| 822.86 | 0.002 |
| 823.1 | 0 |
| 823.34 | 0 |
| 823.58 | 0 |
| 823.82 | 0 |
| 824.06 | -0.001 |
| 824.3 | 0.002 |
| 824.53 | 0 |
| 824.77 | -0.001 |
| 825.01 | 0 |
| 825.25 | -0.001 |
| 825.49 | 0 |
| 825.73 | -0.001 |
| 825.96 | 0.001 |
| 826.2 | -0.001 |
| 826.44 | 0.001 |
| 826.68 | 0.001 |
| 826.92 | 0 |
| 827.16 | -0.002 |
| 827.4 | 0 |
| 827.63 | 0 |
| 827.87 | -0.001 |
| 828.11 | 0 |
| 828.35 | 0.002 |
| 828.59 | 0 |
| 828.83 | 0 |
| 829.07 | 0 |
| 829.3 | 0 |
| 829.54 | 0 |
| 829.78 | 0.002 |
| 830.02 | -0.002 |
| 830.26 | 0 |
| 830.5 | -0.001 |
| 830.74 | 0 |
| 830.97 | -0.001 |
| 831.21 | 0.001 |
| 831.45 | 0 |
| 831.69 | -0.001 |
| 831.93 | -0.002 |
| 832.17 | 0.002 |
| 832.41 | -0.001 |
| 832.64 | -0.001 |
| 832.88 | -0.001 |
| 833.12 | 0.001 |
| 833.36 | 0 |
| 833.6 | 0 |
| 833.84 | -0.001 |
| 834.08 | 0.002 |
| 834.32 | -0.002 |
| 834.55 | 0 |
| 834.79 | 0 |
| 835.03 | 0 |
| 835.27 | -0.001 |
| 835.51 | 0.001 |
| 835.75 | -0.001 |
| 835.99 | -0.003 |
| 836.23 | -0.001 |
| 836.46 | 0.001 |
| 836.7 | 0 |
| 836.94 | -0.002 |
| 837.18 | 0 |
| 837.42 | 0 |
| 837.66 | 0 |
| 837.9 | -0.001 |
| 838.14 | 0.002 |
| 838.38 | -0.001 |
| 838.61 | -0.001 |
| 838.85 | 0 |
| 839.09 | -0.001 |
| 839.33 | 0 |
| 839.57 | 0.001 |
| 839.81 | 0 |
| 840.05 | 0.001 |
| 840.29 | 0 |
| 840.52 | -0.003 |
| 840.76 | -0.001 |
| 841.0 | 0.001 |
| 841.24 | 0.002 |
| 841.48 | -0.002 |
| 841.72 | 0 |
| 841.96 | 0 |
| 842.2 | -0.001 |
| 842.44 | -0.002 |
| 842.68 | 0 |
| 842.91 | 0 |
| 843.15 | -0.001 |
| 843.39 | -0.003 |
| 843.63 | 0 |
| 843.87 | 0.002 |
| 844.11 | 0 |
| 844.35 | -0.002 |
| 844.59 | 0.001 |
| 844.83 | -0.001 |
| 845.07 | 0 |
| 845.3 | 0.001 |
| 845.54 | 0.001 |
| 845.78 | 0.001 |
| 846.02 | 0 |
| 846.26 | -0.002 |
| 846.5 | 0 |
| 846.74 | -0.001 |
| 846.98 | 0.001 |
| 847.22 | 0.001 |
| 847.46 | -0.001 |
| 847.7 | 0 |
| 847.93 | 0.001 |
| 848.17 | -0.001 |
| 848.41 | 0 |
| 848.65 | -0.001 |
| 848.89 | 0 |
| 849.13 | -0.001 |
| 849.37 | 0.001 |
| 849.61 | 0.003 |
| 849.85 | -0.001 |
| 850.09 | -0.002 |
| 850.33 | -0.001 |
| 850.57 | 0 |
| 850.8 | 0.002 |
| 851.04 | -0.001 |
| 851.28 | -0.001 |
| 851.52 | 0 |
| 851.76 | 0.001 |
| 852.0 | 0 |
| 852.24 | 0 |
| 852.48 | -0.001 |
| 852.72 | -0.001 |
| 852.96 | 0.001 |
| 853.2 | 0.001 |
| 853.44 | -0.001 |
| 853.68 | 0.001 |
| 853.91 | -0.003 |
| 854.15 | -0.001 |
| 854.39 | -0.001 |
| 854.63 | 0.001 |
| 854.87 | 0.001 |
| 855.11 | 0.002 |
| 855.35 | 0 |
| 855.59 | 0 |
| 855.83 | 0 |
| 856.07 | 0.002 |
| 856.31 | 0 |
| 856.55 | 0.002 |
| 856.79 | -0.001 |
| 857.03 | 0.001 |
| 857.27 | -0.001 |
| 857.5 | 0.002 |
| 857.74 | -0.001 |
| 857.98 | 0.001 |
| 858.22 | -0.001 |
| 858.46 | 0 |
| 858.7 | -0.003 |
| 858.94 | 0.001 |
| 859.18 | -0.001 |
| 859.42 | 0.002 |
| 859.66 | 0.001 |
| 859.9 | 0 |
| 860.14 | -0.003 |
| 860.38 | -0.001 |
| 860.62 | -0.001 |
| 860.86 | 0 |
| 861.1 | -0.001 |
| 861.34 | -0.001 |
| 861.58 | 0.001 |
| 861.81 | 0 |
| 862.05 | -0.001 |
| 862.29 | 0.001 |
| 862.53 | -0.002 |
| 862.77 | 0 |
| 863.01 | 0.001 |
| 863.25 | 0 |
| 863.49 | -0.001 |
| 863.73 | -0.001 |
| 863.97 | -0.003 |
| 864.21 | 0.002 |
| 864.45 | -0.002 |
| 864.69 | 0.001 |
| 864.93 | -0.001 |
| 865.17 | -0.002 |
| 865.41 | -0.001 |
| 865.65 | -0.001 |
| 865.89 | -0.001 |
| 866.13 | -0.001 |
| 866.37 | -0.001 |
| 866.61 | 0.003 |
| 866.85 | -0.001 |
| 867.09 | 0 |
| 867.32 | -0.001 |
| 867.56 | -0.003 |
| 867.8 | 0.001 |
| 868.04 | 0 |
| 868.28 | -0.002 |
| 868.52 | -0.001 |
| 868.76 | -0.002 |
| 869.0 | 0.001 |
| 869.24 | -0.001 |
| 869.48 | 0 |
| 869.72 | -0.001 |
| 869.96 | 0.001 |
| 870.2 | -0.001 |
| 870.44 | 0 |
| 870.68 | -0.002 |
| 870.92 | 0.001 |
| 871.16 | -0.002 |
| 871.4 | 0.001 |
| 871.64 | 0 |
| 871.88 | -0.001 |
| 872.12 | -0.002 |
| 872.36 | 0.001 |
| 872.6 | -0.003 |
| 872.84 | 0.001 |
| 873.08 | -0.001 |
| 873.32 | 0.001 |
| 873.56 | -0.001 |
| 873.8 | 0.001 |
| 874.04 | 0 |
| 874.28 | 0.002 |
| 874.52 | 0 |
| 874.76 | 0 |
| 875.0 | -0.002 |
| 875.24 | -0.001 |
| 875.48 | -0.001 |
| 875.72 | 0.001 |
| 875.96 | 0 |
| 876.2 | 0 |
| 876.44 | -0.001 |
| 876.68 | 0.002 |
| 876.92 | -0.001 |
| 877.16 | -0.001 |
| 877.4 | -0.001 |
| 877.64 | -0.001 |
| 877.88 | -0.001 |
| 878.12 | 0.002 |
| 878.36 | 0 |
| 878.6 | -0.002 |
| 878.84 | -0.001 |
| 879.08 | 0 |
| 879.32 | 0.002 |
| 879.56 | 0 |
| 879.8 | 0 |
| 880.04 | 0.001 |
| 880.28 | 0 |
| 880.52 | 0 |
| 880.76 | -0.001 |
| 881.0 | -0.002 |
| 881.24 | -0.001 |
| 881.48 | 0 |
| 881.72 | 0.001 |
| 881.96 | -0.001 |
| 882.2 | 0.001 |
| 882.44 | 0 |
| 882.68 | 0 |
| 882.92 | -0.002 |
| 883.16 | 0.001 |
| 883.4 | 0 |
| 883.64 | 0 |
| 883.88 | -0.001 |
| 884.12 | 0 |
| 884.36 | -0.002 |
| 884.6 | -0.001 |
| 884.84 | -0.001 |
| 885.08 | 0 |
| 885.32 | -0.003 |
| 885.56 | 0 |
| 885.8 | -0.001 |
| 886.04 | 0.001 |
| 886.28 | -0.001 |
| 886.52 | 0.001 |
| 886.76 | 0.001 |
| 887.0 | -0.002 |
| 887.24 | 0 |
| 887.48 | 0 |
| 887.72 | 0 |
| 887.96 | 0.002 |
| 888.2 | -0.002 |
| 888.44 | 0.002 |
| 888.68 | 0 |
| 888.92 | 0 |
| 889.16 | -0.002 |
| 889.4 | 0 |
| 889.64 | 0 |
| 889.88 | 0.002 |
| 890.12 | 0 |
| 890.36 | -0.001 |
| 890.6 | 0 |
| 890.84 | 0.001 |
| 891.08 | 0 |
| 891.32 | 0 |
| 891.56 | 0 |
| 891.8 | 0 |
| 892.04 | 0 |
| 892.28 | 0.001 |
| 892.52 | 0.002 |
| 892.76 | -0.001 |
| 893.0 | 0 |
| 893.24 | 0 |
| 893.48 | -0.001 |
| 893.73 | 0 |
| 893.97 | -0.001 |
| 894.21 | 0 |
| 894.45 | -0.001 |
| 894.69 | -0.001 |
| 894.93 | 0 |
| 895.17 | 0 |
| 895.41 | -0.001 |
| 895.65 | -0.002 |
| 895.89 | -0.001 |
| 896.13 | 0.001 |
| 896.37 | -0.001 |
| 896.61 | -0.002 |
| 896.85 | -0.001 |
| 897.09 | 0.002 |
| 897.33 | 0 |
| 897.57 | 0.002 |
| 897.81 | -0.002 |
| 898.05 | 0 |
| 898.29 | -0.001 |
| 898.53 | 0 |
| 898.77 | 0.001 |
| 899.01 | 0 |
| 899.25 | 0 |
| 899.5 | 0 |
| 899.74 | 0.001 |
| 899.98 | 0.002 |
| 900.22 | 0 |
| 900.46 | 0.001 |
| 900.7 | -0.001 |
| 900.94 | 0.001 |
| 901.18 | -0.001 |
| 901.42 | -0.002 |
| 901.66 | -0.001 |
| 901.9 | 0.001 |
| 902.14 | -0.002 |
| 902.38 | -0.002 |
| 902.62 | -0.002 |
| 902.86 | 0 |
| 903.1 | 0.001 |
| 903.34 | -0.001 |
| 903.58 | 0.002 |
| 903.82 | 0.001 |
| 904.07 | -0.001 |
| 904.31 | 0 |
| 904.55 | 0 |
| 904.79 | 0 |
| 905.03 | 0 |
| 905.27 | -0.001 |
| 905.51 | -0.002 |
| 905.75 | 0 |
| 905.99 | -0.002 |
| 906.23 | 0.001 |
| 906.47 | 0 |
| 906.71 | 0.002 |
| 906.95 | -0.004 |
| 907.19 | 0.001 |
| 907.43 | -0.002 |
| 907.68 | 0.003 |
| 907.92 | -0.001 |
| 908.16 | 0.001 |
| 908.4 | -0.003 |
| 908.64 | 0.002 |
| 908.88 | 0 |
| 909.12 | -0.002 |
| 909.36 | 0.001 |
| 909.6 | -0.003 |
| 909.84 | -0.001 |
| 910.08 | 0 |
| 910.32 | 0 |
| 910.56 | 0 |
| 910.8 | -0.002 |
| 911.05 | -0.002 |
| 911.29 | 0 |
| 911.53 | 0.001 |
| 911.77 | -0.002 |
| 912.01 | -0.002 |
| 912.25 | 0.003 |
| 912.49 | 0 |
| 912.73 | 0.002 |
| 912.97 | 0.002 |
| 913.21 | -0.002 |
| 913.45 | 0 |
| 913.69 | -0.002 |
| 913.93 | 0 |
| 914.18 | -0.002 |
| 914.42 | 0.003 |
| 914.66 | 0.002 |
| 914.9 | -0.001 |
| 915.14 | -0.001 |
| 915.38 | 0.003 |
| 915.62 | -0.002 |
| 915.86 | 0 |
| 916.1 | 0 |
| 916.34 | 0.001 |
| 916.58 | 0.002 |
| 916.83 | 0 |
| 917.07 | 0 |
| 917.31 | 0 |
| 917.55 | -0.002 |
| 917.79 | 0.001 |
| 918.03 | -0.001 |
| 918.27 | 0 |
| 918.51 | -0.001 |
| 918.75 | 0 |
| 918.99 | 0 |
| 919.23 | 0.002 |
| 919.48 | 0 |
| 919.72 | -0.002 |
| 919.96 | -0.002 |
| 920.2 | -0.001 |
| 920.44 | -0.001 |
| 920.68 | 0.001 |
| 920.92 | -0.001 |
| 921.16 | -0.001 |
| 921.4 | -0.001 |
| 921.64 | 0.002 |
| 921.89 | 0.001 |
| 922.13 | 0.001 |
| 922.37 | 0 |
| 922.61 | 0 |
| 922.85 | -0.001 |
| 923.09 | 0.001 |
| 923.33 | 0 |
| 923.57 | 0.001 |
| 923.81 | -0.001 |
| 924.05 | -0.002 |
| 924.3 | 0 |
| 924.54 | -0.001 |
| 924.78 | 0 |
| 925.02 | -0.001 |
| 925.26 | 0 |
| 925.5 | 0.001 |
| 925.74 | 0 |
| 925.98 | -0.002 |
| 926.22 | 0.001 |
| 926.47 | 0.001 |
| 926.71 | -0.003 |
| 926.95 | -0.001 |
| 927.19 | 0 |
| 927.43 | 0 |
| 927.67 | -0.002 |
| 927.91 | 0.001 |
| 928.15 | 0 |
| 928.4 | 0.002 |
| 928.64 | -0.003 |
| 928.88 | 0 |
| 929.12 | 0.001 |
| 929.36 | -0.001 |
| 929.6 | 0.001 |
| 929.84 | -0.001 |
| 930.08 | 0 |
| 930.32 | 0.001 |
| 930.57 | -0.001 |
| 930.81 | 0 |
| 931.05 | -0.001 |
| 931.29 | 0 |
| 931.53 | 0 |
| 931.77 | 0 |
| 932.01 | -0.001 |
| 932.25 | 0 |
| 932.5 | 0.002 |
| 932.74 | -0.001 |
| 932.98 | 0.001 |
| 933.22 | -0.001 |
| 933.46 | 0 |
| 933.7 | -0.002 |
| 933.94 | -0.001 |
| 934.18 | 0.001 |
| 934.43 | 0 |
| 934.67 | 0.001 |
| 934.91 | 0.001 |
| 935.15 | 0.002 |
| 935.39 | -0.001 |
| 935.63 | 0 |
| 935.87 | 0.002 |
| 936.12 | 0.001 |
| 936.36 | -0.001 |
| 936.6 | 0 |
| 936.84 | 0 |
| 937.08 | -0.001 |
| 937.32 | 0 |
| 937.56 | -0.001 |
| 937.8 | 0.002 |
| 938.05 | 0.001 |
| 938.29 | -0.001 |
| 938.53 | -0.001 |
| 938.77 | 0 |
| 939.01 | 0.002 |
| 939.25 | -0.001 |
| 939.49 | 0.001 |
| 939.74 | 0.001 |
| 939.98 | 0.001 |
| 940.22 | 0.002 |
| 940.46 | -0.002 |
| 940.7 | -0.001 |
| 940.94 | -0.002 |
| 941.18 | 0.001 |
| 941.43 | 0 |
| 941.67 | 0.001 |
| 941.91 | 0 |
| 942.15 | 0.001 |
| 942.39 | 0.002 |
| 942.63 | -0.001 |
| 942.87 | -0.002 |
| 943.12 | 0.002 |
| 943.36 | -0.003 |
| 943.6 | 0 |
| 943.84 | 0 |
| 944.08 | 0 |
| 944.32 | -0.002 |
| 944.57 | 0.001 |
| 944.81 | -0.001 |
| 945.05 | 0.001 |
| 945.29 | 0 |
| 945.53 | -0.001 |
| 945.77 | 0 |
| 946.01 | -0.001 |
| 946.26 | 0 |
| 946.5 | -0.001 |
| 946.74 | -0.003 |
| 946.98 | 0.001 |
| 947.22 | 0 |
| 947.46 | 0.001 |
| 947.71 | -0.001 |
| 947.95 | 0.001 |
| 948.19 | 0 |
| 948.43 | 0.001 |
| 948.67 | 0 |
| 948.91 | 0 |
| 949.16 | 0.002 |
| 949.4 | 0 |
| 949.64 | 0 |
| 949.88 | 0.001 |
| 950.12 | 0 |
| 950.36 | 0 |
| 950.61 | -0.001 |
| 950.85 | 0 |
| 951.09 | -0.001 |
| 951.33 | -0.001 |
| 951.57 | 0 |
| 951.81 | 0 |
| 952.06 | -0.002 |
| 952.3 | 0 |
| 952.54 | 0 |
| 952.78 | 0.003 |
| 953.02 | 0.001 |
| 953.26 | 0 |
| 953.51 | 0 |
| 953.75 | 0 |
| 953.99 | 0.001 |
| 954.23 | 0 |
| 954.47 | 0 |
| 954.71 | 0.002 |
| 954.96 | -0.003 |
| 955.2 | 0 |
| 955.44 | 0.001 |
| 955.68 | -0.002 |
| 955.92 | -0.002 |
| 956.16 | -0.003 |
| 956.41 | -0.002 |
| 956.65 | 0 |
| 956.89 | 0 |
| 957.13 | 0.003 |
| 957.37 | 0.001 |
| 957.62 | 0.002 |
| 957.86 | 0.001 |
| 958.1 | 0.001 |
| 958.34 | -0.001 |
| 958.58 | 0 |
| 958.82 | -0.001 |
| 959.07 | -0.001 |
| 959.31 | 0 |
| 959.55 | 0.001 |
| 959.79 | 0.002 |
| 960.03 | 0 |
| 960.28 | -0.003 |
| 960.52 | -0.001 |
| 960.76 | -0.002 |
| 961.0 | 0.001 |
| 961.24 | -0.003 |
| 961.48 | 0.001 |
| 961.73 | -0.001 |
| 961.97 | 0.002 |
| 962.21 | 0 |
| 962.45 | 0 |
| 962.69 | 0.001 |
| 962.94 | 0 |
| 963.18 | 0.002 |
| 963.42 | 0 |
| 963.66 | 0 |
| 963.9 | 0.001 |
| 964.15 | -0.001 |
| 964.39 | -0.001 |
| 964.63 | 0 |
| 964.87 | 0.001 |
| 965.11 | -0.003 |
| 965.36 | -0.001 |
| 965.6 | 0 |
| 965.84 | 0 |
| 966.08 | 0 |
| 966.32 | 0.001 |
| 966.57 | 0.001 |
| 966.81 | 0.001 |
| 967.05 | -0.002 |
| 967.29 | 0.002 |
| 967.53 | -0.001 |
| 967.77 | 0 |
| 968.02 | 0.001 |
| 968.26 | 0.001 |
| 968.5 | 0.002 |
| 968.74 | -0.001 |
| 968.99 | -0.001 |
| 969.23 | 0.002 |
| 969.47 | -0.002 |
| 969.71 | 0.002 |
| 969.95 | -0.001 |
| 970.2 | 0.001 |
| 970.44 | -0.001 |
| 970.68 | 0.001 |
| 970.92 | 0 |
| 971.16 | 0 |
| 971.41 | 0 |
| 971.65 | 0 |
| 971.89 | -0.002 |
| 972.13 | -0.002 |
| 972.37 | -0.001 |
| 972.62 | 0 |
| 972.86 | -0.001 |
| 973.1 | 0 |
| 973.34 | -0.001 |
| 973.58 | 0 |
| 973.83 | 0 |
| 974.07 | 0 |
| 974.31 | 0.001 |
| 974.55 | 0.002 |
| 974.8 | 0 |
| 975.04 | 0 |
| 975.28 | -0.002 |
| 975.52 | 0 |
| 975.76 | 0 |
| 976.01 | -0.001 |
| 976.25 | -0.001 |
| 976.49 | 0 |
| 976.73 | 0.003 |
| 976.97 | 0 |
| 977.22 | -0.001 |
| 977.46 | -0.001 |
| 977.7 | 0.001 |
| 977.94 | 0.001 |
| 978.19 | 0 |
| 978.43 | 0.002 |
| 978.67 | -0.002 |
| 978.91 | 0 |
| 979.15 | -0.001 |
| 979.4 | 0 |
| 979.64 | -0.001 |
| 979.88 | 0.001 |
| 980.12 | 0.001 |
| 980.37 | 0.001 |
| 980.61 | 0.001 |
| 980.85 | -0.001 |
| 981.09 | -0.001 |
| 981.33 | 0 |
| 981.58 | 0.002 |
| 981.82 | 0 |
| 982.06 | -0.001 |
| 982.3 | 0.001 |
| 982.55 | 0.001 |
| 982.79 | 0.002 |
| 983.03 | 0 |
| 983.27 | 0 |
| 983.52 | 0 |
| 983.76 | 0.002 |
| 984.0 | -0.001 |
| 984.24 | 0 |
| 984.48 | -0.001 |
| 984.73 | -0.001 |
| 984.97 | -0.001 |
| 985.21 | 0 |
| 985.45 | -0.002 |
| 985.7 | 0 |
| 985.94 | -0.001 |
| 986.18 | 0 |
| 986.42 | -0.002 |
| 986.67 | 0 |
| 986.91 | -0.001 |
| 987.15 | 0 |
| 987.39 | -0.002 |
| 987.63 | 0.001 |
| 987.88 | 0 |
| 988.12 | 0.002 |
| 988.36 | -0.001 |
| 988.6 | 0.002 |
| 988.85 | 0.002 |
| 989.09 | 0.001 |
| 989.33 | -0.001 |
| 989.57 | 0.003 |
| 989.82 | 0 |
| 990.06 | 0.003 |
| 990.3 | 0 |
| 990.54 | 0.002 |
| 990.79 | -0.002 |
| 991.03 | 0.001 |
| 991.27 | 0 |
| 991.51 | 0 |
| 991.76 | -0.001 |
| 992.0 | 0.001 |
| 992.24 | 0.001 |
| 992.48 | 0.002 |
| 992.73 | -0.001 |
| 992.97 | 0.002 |
| 993.21 | -0.002 |
| 993.45 | 0.002 |
| 993.7 | 0 |
| 993.94 | 0 |
| 994.18 | -0.001 |
| 994.42 | 0.001 |
| 994.67 | -0.002 |
| 994.91 | 0.001 |
| 995.15 | -0.002 |
| 995.39 | 0.002 |
| 995.64 | 0 |
| 995.88 | 0.002 |
| 996.12 | 0 |
| 996.36 | -0.001 |
| 996.61 | 0 |
| 996.85 | -0.001 |
| 997.09 | 0.002 |
| 997.33 | -0.001 |
| 997.58 | -0.001 |
| 997.82 | -0.001 |
| 998.06 | -0.002 |
| 998.3 | -0.001 |
| 998.55 | 0 |
| 998.79 | -0.001 |
| 999.03 | -0.001 |
| 999.27 | -0.002 |
| 999.52 | 0.002 |
| 999.76 | -0.001 |
| 1000.0 | 0 |
| 1000.2 | 0.002 |
| 1000.5 | 0.003 |
| 1000.7 | 0.001 |
| 1001.0 | 0.001 |
| 1001.2 | -0.001 |
| 1001.5 | 0.001 |
| 1001.7 | -0.001 |
| 1001.9 | 0.003 |
| 1002.2 | 0 |
| 1002.4 | 0.001 |
| 1002.7 | 0 |
| 1002.9 | -0.001 |
| 1003.2 | -0.001 |
| 1003.4 | 0.001 |
| 1003.6 | -0.002 |
| 1003.9 | 0 |
| 1004.1 | -0.002 |
| 1004.4 | 0.001 |
| 1004.6 | 0.002 |
| 1004.9 | 0.001 |
| 1005.1 | -0.001 |
| 1005.3 | 0.002 |
| 1005.6 | -0.001 |
| 1005.8 | 0 |
| 1006.1 | 0 |
| 1006.3 | 0.002 |
| 1006.6 | -0.003 |
| 1006.8 | 0.001 |
| 1007.0 | -0.002 |
| 1007.3 | 0.002 |
| 1007.5 | -0.001 |
| 1007.8 | 0.002 |
| 1008.0 | 0 |
| 1008.3 | -0.001 |
| 1008.5 | 0 |
| 1008.7 | 0.001 |
| 1009.0 | 0 |
| 1009.2 | 0.002 |
| 1009.5 | 0.001 |
| 1009.7 | 0 |
| 1010.0 | -0.001 |
| 1010.2 | 0.001 |
| 1010.4 | 0 |
| 1010.7 | 0.002 |
| 1010.9 | -0.001 |
| 1011.2 | 0.002 |
| 1011.4 | 0.001 |
| 1011.7 | -0.001 |
| 1011.9 | -0.001 |
| 1012.1 | 0.001 |
| 1012.4 | 0 |
| 1012.6 | 0 |
| 1012.9 | -0.001 |
| 1013.1 | 0 |
| 1013.4 | 0 |
| 1013.6 | 0.001 |
| 1013.8 | -0.001 |
| 1014.1 | 0 |
| 1014.3 | -0.001 |
| 1014.6 | 0.002 |
| 1014.8 | -0.002 |
| 1015.1 | 0 |
| 1015.3 | 0.001 |
| 1015.5 | 0.003 |
| 1015.8 | 0 |
| 1016.0 | 0.001 |
| 1016.3 | 0 |
| 1016.5 | 0 |
| 1016.8 | -0.002 |
| 1017.0 | 0.002 |
| 1017.2 | -0.001 |
| 1017.5 | 0.001 |
| 1017.7 | -0.001 |
| 1018.0 | 0.002 |
| 1018.2 | -0.002 |
| 1018.5 | 0.001 |
| 1018.7 | 0.001 |
| 1018.9 | 0.002 |
| 1019.2 | -0.001 |
| 1019.4 | 0 |
| 1019.7 | -0.002 |
| 1019.9 | -0.002 |
| 1020.2 | -0.001 |
| 1020.4 | 0.003 |
| 1020.6 | -0.003 |
| 1020.9 | -0.002 |
| 1021.1 | 0 |
| 1021.4 | -0.002 |
| 1021.6 | -0.003 |
| 1021.9 | -0.002 |